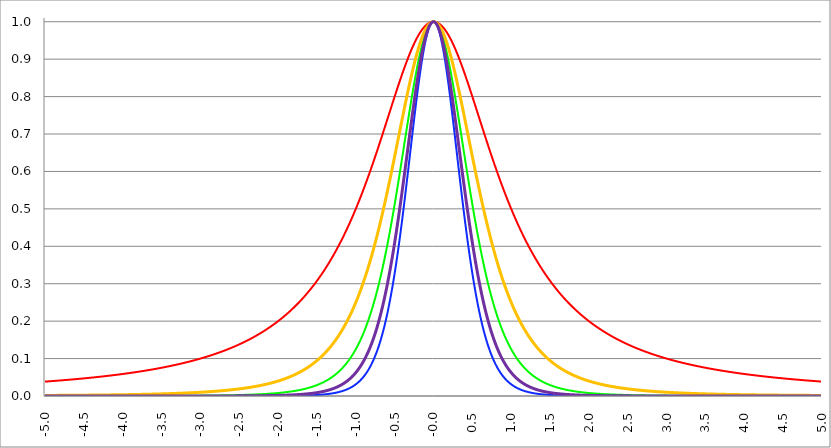
| Category | Series 1 | Series 0 | Series 2 | Series 3 | Series 4 |
|---|---|---|---|---|---|
| -5.0 | 0.038 | 0 | 0 | 0.001 | 0 |
| -4.995 | 0.039 | 0 | 0 | 0.001 | 0 |
| -4.99 | 0.039 | 0 | 0 | 0.001 | 0 |
| -4.985 | 0.039 | 0 | 0 | 0.001 | 0 |
| -4.98 | 0.039 | 0 | 0 | 0.002 | 0 |
| -4.975 | 0.039 | 0 | 0 | 0.002 | 0 |
| -4.97 | 0.039 | 0 | 0 | 0.002 | 0 |
| -4.965000000000001 | 0.039 | 0 | 0 | 0.002 | 0 |
| -4.960000000000001 | 0.039 | 0 | 0 | 0.002 | 0 |
| -4.955000000000001 | 0.039 | 0 | 0 | 0.002 | 0 |
| -4.950000000000001 | 0.039 | 0 | 0 | 0.002 | 0 |
| -4.945000000000001 | 0.039 | 0 | 0 | 0.002 | 0 |
| -4.940000000000001 | 0.039 | 0 | 0 | 0.002 | 0 |
| -4.935000000000001 | 0.039 | 0 | 0 | 0.002 | 0 |
| -4.930000000000001 | 0.04 | 0 | 0 | 0.002 | 0 |
| -4.925000000000002 | 0.04 | 0 | 0 | 0.002 | 0 |
| -4.920000000000002 | 0.04 | 0 | 0 | 0.002 | 0 |
| -4.915000000000002 | 0.04 | 0 | 0 | 0.002 | 0 |
| -4.910000000000002 | 0.04 | 0 | 0 | 0.002 | 0 |
| -4.905000000000002 | 0.04 | 0 | 0 | 0.002 | 0 |
| -4.900000000000002 | 0.04 | 0 | 0 | 0.002 | 0 |
| -4.895000000000002 | 0.04 | 0 | 0 | 0.002 | 0 |
| -4.890000000000002 | 0.04 | 0 | 0 | 0.002 | 0 |
| -4.885000000000002 | 0.04 | 0 | 0 | 0.002 | 0 |
| -4.880000000000002 | 0.04 | 0 | 0 | 0.002 | 0 |
| -4.875000000000003 | 0.04 | 0 | 0 | 0.002 | 0 |
| -4.870000000000003 | 0.04 | 0 | 0 | 0.002 | 0 |
| -4.865000000000003 | 0.041 | 0 | 0 | 0.002 | 0 |
| -4.860000000000003 | 0.041 | 0 | 0 | 0.002 | 0 |
| -4.855000000000003 | 0.041 | 0 | 0 | 0.002 | 0 |
| -4.850000000000003 | 0.041 | 0 | 0 | 0.002 | 0 |
| -4.845000000000003 | 0.041 | 0 | 0 | 0.002 | 0 |
| -4.840000000000003 | 0.041 | 0 | 0 | 0.002 | 0 |
| -4.835000000000003 | 0.041 | 0 | 0 | 0.002 | 0 |
| -4.830000000000004 | 0.041 | 0 | 0 | 0.002 | 0 |
| -4.825000000000004 | 0.041 | 0 | 0 | 0.002 | 0 |
| -4.820000000000004 | 0.041 | 0 | 0 | 0.002 | 0 |
| -4.815000000000004 | 0.041 | 0 | 0 | 0.002 | 0 |
| -4.810000000000004 | 0.041 | 0 | 0 | 0.002 | 0 |
| -4.805000000000004 | 0.042 | 0 | 0 | 0.002 | 0 |
| -4.800000000000004 | 0.042 | 0 | 0 | 0.002 | 0 |
| -4.795000000000004 | 0.042 | 0 | 0 | 0.002 | 0 |
| -4.790000000000004 | 0.042 | 0 | 0 | 0.002 | 0 |
| -4.785000000000004 | 0.042 | 0 | 0 | 0.002 | 0 |
| -4.780000000000004 | 0.042 | 0 | 0 | 0.002 | 0 |
| -4.775000000000004 | 0.042 | 0 | 0 | 0.002 | 0 |
| -4.770000000000004 | 0.042 | 0 | 0 | 0.002 | 0 |
| -4.765000000000005 | 0.042 | 0 | 0 | 0.002 | 0 |
| -4.760000000000005 | 0.042 | 0 | 0 | 0.002 | 0 |
| -4.755000000000005 | 0.042 | 0 | 0 | 0.002 | 0 |
| -4.750000000000005 | 0.042 | 0 | 0 | 0.002 | 0 |
| -4.745000000000005 | 0.043 | 0 | 0 | 0.002 | 0 |
| -4.740000000000005 | 0.043 | 0 | 0 | 0.002 | 0 |
| -4.735000000000005 | 0.043 | 0 | 0 | 0.002 | 0 |
| -4.730000000000005 | 0.043 | 0 | 0 | 0.002 | 0 |
| -4.725000000000006 | 0.043 | 0 | 0 | 0.002 | 0 |
| -4.720000000000006 | 0.043 | 0 | 0 | 0.002 | 0 |
| -4.715000000000006 | 0.043 | 0 | 0 | 0.002 | 0 |
| -4.710000000000006 | 0.043 | 0 | 0 | 0.002 | 0 |
| -4.705000000000006 | 0.043 | 0 | 0 | 0.002 | 0 |
| -4.700000000000006 | 0.043 | 0 | 0 | 0.002 | 0 |
| -4.695000000000006 | 0.043 | 0 | 0 | 0.002 | 0 |
| -4.690000000000006 | 0.043 | 0 | 0 | 0.002 | 0 |
| -4.685000000000007 | 0.044 | 0 | 0 | 0.002 | 0 |
| -4.680000000000007 | 0.044 | 0 | 0 | 0.002 | 0 |
| -4.675000000000007 | 0.044 | 0 | 0 | 0.002 | 0 |
| -4.670000000000007 | 0.044 | 0 | 0 | 0.002 | 0 |
| -4.665000000000007 | 0.044 | 0 | 0 | 0.002 | 0 |
| -4.660000000000007 | 0.044 | 0 | 0 | 0.002 | 0 |
| -4.655000000000007 | 0.044 | 0 | 0 | 0.002 | 0 |
| -4.650000000000007 | 0.044 | 0 | 0 | 0.002 | 0 |
| -4.645000000000007 | 0.044 | 0 | 0 | 0.002 | 0 |
| -4.640000000000008 | 0.044 | 0 | 0 | 0.002 | 0 |
| -4.635000000000008 | 0.044 | 0 | 0 | 0.002 | 0 |
| -4.630000000000008 | 0.045 | 0 | 0 | 0.002 | 0 |
| -4.625000000000008 | 0.045 | 0 | 0 | 0.002 | 0 |
| -4.620000000000008 | 0.045 | 0 | 0 | 0.002 | 0 |
| -4.615000000000008 | 0.045 | 0 | 0 | 0.002 | 0 |
| -4.610000000000008 | 0.045 | 0 | 0 | 0.002 | 0 |
| -4.605000000000008 | 0.045 | 0 | 0 | 0.002 | 0 |
| -4.600000000000008 | 0.045 | 0 | 0 | 0.002 | 0 |
| -4.595000000000009 | 0.045 | 0 | 0 | 0.002 | 0 |
| -4.590000000000009 | 0.045 | 0 | 0 | 0.002 | 0 |
| -4.585000000000009 | 0.045 | 0 | 0 | 0.002 | 0 |
| -4.580000000000009 | 0.046 | 0 | 0 | 0.002 | 0 |
| -4.57500000000001 | 0.046 | 0 | 0 | 0.002 | 0 |
| -4.57000000000001 | 0.046 | 0 | 0 | 0.002 | 0 |
| -4.565000000000009 | 0.046 | 0 | 0 | 0.002 | 0 |
| -4.560000000000009 | 0.046 | 0 | 0 | 0.002 | 0 |
| -4.555000000000009 | 0.046 | 0 | 0 | 0.002 | 0 |
| -4.55000000000001 | 0.046 | 0 | 0 | 0.002 | 0 |
| -4.54500000000001 | 0.046 | 0 | 0 | 0.002 | 0 |
| -4.54000000000001 | 0.046 | 0 | 0 | 0.002 | 0 |
| -4.53500000000001 | 0.046 | 0 | 0 | 0.002 | 0 |
| -4.53000000000001 | 0.046 | 0 | 0 | 0.002 | 0 |
| -4.52500000000001 | 0.047 | 0 | 0 | 0.002 | 0 |
| -4.52000000000001 | 0.047 | 0 | 0 | 0.002 | 0 |
| -4.51500000000001 | 0.047 | 0 | 0 | 0.002 | 0 |
| -4.51000000000001 | 0.047 | 0 | 0 | 0.002 | 0 |
| -4.505000000000011 | 0.047 | 0 | 0 | 0.002 | 0 |
| -4.500000000000011 | 0.047 | 0 | 0 | 0.002 | 0 |
| -4.495000000000011 | 0.047 | 0 | 0 | 0.002 | 0 |
| -4.490000000000011 | 0.047 | 0 | 0 | 0.002 | 0 |
| -4.485000000000011 | 0.047 | 0 | 0 | 0.002 | 0 |
| -4.480000000000011 | 0.047 | 0 | 0 | 0.002 | 0 |
| -4.475000000000011 | 0.048 | 0 | 0 | 0.002 | 0 |
| -4.470000000000011 | 0.048 | 0 | 0 | 0.002 | 0 |
| -4.465000000000011 | 0.048 | 0 | 0 | 0.002 | 0 |
| -4.460000000000011 | 0.048 | 0 | 0 | 0.002 | 0 |
| -4.455000000000012 | 0.048 | 0 | 0 | 0.002 | 0 |
| -4.450000000000012 | 0.048 | 0 | 0 | 0.002 | 0 |
| -4.445000000000012 | 0.048 | 0 | 0 | 0.002 | 0 |
| -4.440000000000012 | 0.048 | 0 | 0 | 0.002 | 0 |
| -4.435000000000012 | 0.048 | 0 | 0 | 0.002 | 0 |
| -4.430000000000012 | 0.048 | 0 | 0 | 0.002 | 0 |
| -4.425000000000012 | 0.049 | 0 | 0 | 0.002 | 0 |
| -4.420000000000012 | 0.049 | 0 | 0 | 0.002 | 0 |
| -4.415000000000012 | 0.049 | 0 | 0 | 0.002 | 0 |
| -4.410000000000013 | 0.049 | 0 | 0 | 0.002 | 0 |
| -4.405000000000013 | 0.049 | 0 | 0 | 0.002 | 0 |
| -4.400000000000013 | 0.049 | 0 | 0 | 0.002 | 0 |
| -4.395000000000013 | 0.049 | 0 | 0 | 0.002 | 0 |
| -4.390000000000013 | 0.049 | 0 | 0 | 0.002 | 0 |
| -4.385000000000013 | 0.049 | 0 | 0 | 0.002 | 0 |
| -4.380000000000013 | 0.05 | 0 | 0 | 0.002 | 0 |
| -4.375000000000013 | 0.05 | 0 | 0 | 0.002 | 0 |
| -4.370000000000013 | 0.05 | 0 | 0 | 0.002 | 0 |
| -4.365000000000013 | 0.05 | 0 | 0 | 0.002 | 0 |
| -4.360000000000014 | 0.05 | 0 | 0 | 0.002 | 0 |
| -4.355000000000014 | 0.05 | 0 | 0 | 0.003 | 0 |
| -4.350000000000014 | 0.05 | 0 | 0 | 0.003 | 0 |
| -4.345000000000014 | 0.05 | 0 | 0 | 0.003 | 0 |
| -4.340000000000014 | 0.05 | 0 | 0 | 0.003 | 0 |
| -4.335000000000014 | 0.051 | 0 | 0 | 0.003 | 0 |
| -4.330000000000014 | 0.051 | 0 | 0 | 0.003 | 0 |
| -4.325000000000014 | 0.051 | 0 | 0 | 0.003 | 0 |
| -4.320000000000014 | 0.051 | 0 | 0 | 0.003 | 0 |
| -4.315000000000015 | 0.051 | 0 | 0 | 0.003 | 0 |
| -4.310000000000015 | 0.051 | 0 | 0 | 0.003 | 0 |
| -4.305000000000015 | 0.051 | 0 | 0 | 0.003 | 0 |
| -4.300000000000015 | 0.051 | 0 | 0 | 0.003 | 0 |
| -4.295000000000015 | 0.051 | 0 | 0 | 0.003 | 0 |
| -4.290000000000015 | 0.052 | 0 | 0 | 0.003 | 0 |
| -4.285000000000015 | 0.052 | 0 | 0 | 0.003 | 0 |
| -4.280000000000015 | 0.052 | 0 | 0 | 0.003 | 0 |
| -4.275000000000015 | 0.052 | 0 | 0 | 0.003 | 0 |
| -4.270000000000015 | 0.052 | 0 | 0 | 0.003 | 0 |
| -4.265000000000016 | 0.052 | 0 | 0 | 0.003 | 0 |
| -4.260000000000016 | 0.052 | 0 | 0 | 0.003 | 0 |
| -4.255000000000016 | 0.052 | 0 | 0 | 0.003 | 0 |
| -4.250000000000016 | 0.052 | 0 | 0 | 0.003 | 0 |
| -4.245000000000016 | 0.053 | 0 | 0 | 0.003 | 0 |
| -4.240000000000016 | 0.053 | 0 | 0 | 0.003 | 0 |
| -4.235000000000016 | 0.053 | 0 | 0 | 0.003 | 0 |
| -4.230000000000016 | 0.053 | 0 | 0 | 0.003 | 0 |
| -4.225000000000017 | 0.053 | 0 | 0 | 0.003 | 0 |
| -4.220000000000017 | 0.053 | 0 | 0 | 0.003 | 0 |
| -4.215000000000017 | 0.053 | 0 | 0 | 0.003 | 0 |
| -4.210000000000017 | 0.053 | 0 | 0 | 0.003 | 0 |
| -4.205000000000017 | 0.054 | 0 | 0 | 0.003 | 0 |
| -4.200000000000017 | 0.054 | 0 | 0 | 0.003 | 0 |
| -4.195000000000017 | 0.054 | 0 | 0 | 0.003 | 0 |
| -4.190000000000017 | 0.054 | 0 | 0 | 0.003 | 0 |
| -4.185000000000017 | 0.054 | 0 | 0 | 0.003 | 0 |
| -4.180000000000017 | 0.054 | 0 | 0 | 0.003 | 0 |
| -4.175000000000018 | 0.054 | 0 | 0 | 0.003 | 0 |
| -4.170000000000018 | 0.054 | 0 | 0 | 0.003 | 0 |
| -4.165000000000018 | 0.055 | 0 | 0 | 0.003 | 0 |
| -4.160000000000018 | 0.055 | 0 | 0 | 0.003 | 0 |
| -4.155000000000018 | 0.055 | 0 | 0 | 0.003 | 0 |
| -4.150000000000018 | 0.055 | 0 | 0 | 0.003 | 0 |
| -4.145000000000018 | 0.055 | 0 | 0 | 0.003 | 0 |
| -4.140000000000018 | 0.055 | 0 | 0 | 0.003 | 0 |
| -4.135000000000018 | 0.055 | 0 | 0 | 0.003 | 0 |
| -4.130000000000019 | 0.055 | 0 | 0 | 0.003 | 0 |
| -4.125000000000019 | 0.056 | 0 | 0 | 0.003 | 0 |
| -4.120000000000019 | 0.056 | 0 | 0 | 0.003 | 0 |
| -4.115000000000019 | 0.056 | 0 | 0 | 0.003 | 0 |
| -4.110000000000019 | 0.056 | 0 | 0 | 0.003 | 0 |
| -4.105000000000019 | 0.056 | 0 | 0 | 0.003 | 0 |
| -4.100000000000019 | 0.056 | 0 | 0 | 0.003 | 0 |
| -4.095000000000019 | 0.056 | 0 | 0 | 0.003 | 0 |
| -4.090000000000019 | 0.056 | 0 | 0 | 0.003 | 0 |
| -4.085000000000019 | 0.057 | 0 | 0 | 0.003 | 0 |
| -4.08000000000002 | 0.057 | 0 | 0 | 0.003 | 0 |
| -4.07500000000002 | 0.057 | 0 | 0 | 0.003 | 0 |
| -4.07000000000002 | 0.057 | 0 | 0 | 0.003 | 0 |
| -4.06500000000002 | 0.057 | 0 | 0 | 0.003 | 0 |
| -4.06000000000002 | 0.057 | 0 | 0 | 0.003 | 0 |
| -4.05500000000002 | 0.057 | 0 | 0 | 0.003 | 0 |
| -4.05000000000002 | 0.057 | 0 | 0 | 0.003 | 0 |
| -4.04500000000002 | 0.058 | 0 | 0 | 0.003 | 0 |
| -4.04000000000002 | 0.058 | 0 | 0 | 0.003 | 0 |
| -4.03500000000002 | 0.058 | 0 | 0 | 0.003 | 0 |
| -4.03000000000002 | 0.058 | 0 | 0 | 0.003 | 0 |
| -4.025000000000021 | 0.058 | 0 | 0 | 0.003 | 0 |
| -4.020000000000021 | 0.058 | 0 | 0 | 0.003 | 0 |
| -4.015000000000021 | 0.058 | 0 | 0 | 0.003 | 0 |
| -4.010000000000021 | 0.059 | 0 | 0 | 0.003 | 0 |
| -4.005000000000021 | 0.059 | 0 | 0 | 0.003 | 0 |
| -4.000000000000021 | 0.059 | 0 | 0 | 0.003 | 0 |
| -3.995000000000021 | 0.059 | 0 | 0 | 0.003 | 0 |
| -3.990000000000021 | 0.059 | 0 | 0 | 0.003 | 0 |
| -3.985000000000022 | 0.059 | 0 | 0 | 0.004 | 0 |
| -3.980000000000022 | 0.059 | 0 | 0 | 0.004 | 0 |
| -3.975000000000022 | 0.06 | 0 | 0 | 0.004 | 0 |
| -3.970000000000022 | 0.06 | 0 | 0 | 0.004 | 0 |
| -3.965000000000022 | 0.06 | 0 | 0 | 0.004 | 0 |
| -3.960000000000022 | 0.06 | 0 | 0 | 0.004 | 0 |
| -3.955000000000022 | 0.06 | 0 | 0 | 0.004 | 0 |
| -3.950000000000022 | 0.06 | 0 | 0 | 0.004 | 0 |
| -3.945000000000022 | 0.06 | 0 | 0 | 0.004 | 0 |
| -3.940000000000023 | 0.061 | 0 | 0 | 0.004 | 0 |
| -3.935000000000023 | 0.061 | 0 | 0 | 0.004 | 0 |
| -3.930000000000023 | 0.061 | 0 | 0 | 0.004 | 0 |
| -3.925000000000023 | 0.061 | 0 | 0 | 0.004 | 0 |
| -3.920000000000023 | 0.061 | 0 | 0 | 0.004 | 0 |
| -3.915000000000023 | 0.061 | 0 | 0 | 0.004 | 0 |
| -3.910000000000023 | 0.061 | 0 | 0 | 0.004 | 0 |
| -3.905000000000023 | 0.062 | 0 | 0 | 0.004 | 0 |
| -3.900000000000023 | 0.062 | 0 | 0 | 0.004 | 0 |
| -3.895000000000023 | 0.062 | 0 | 0 | 0.004 | 0 |
| -3.890000000000024 | 0.062 | 0 | 0 | 0.004 | 0 |
| -3.885000000000024 | 0.062 | 0 | 0 | 0.004 | 0 |
| -3.880000000000024 | 0.062 | 0 | 0 | 0.004 | 0 |
| -3.875000000000024 | 0.062 | 0 | 0 | 0.004 | 0 |
| -3.870000000000024 | 0.063 | 0 | 0 | 0.004 | 0 |
| -3.865000000000024 | 0.063 | 0 | 0 | 0.004 | 0 |
| -3.860000000000024 | 0.063 | 0 | 0 | 0.004 | 0 |
| -3.855000000000024 | 0.063 | 0 | 0 | 0.004 | 0 |
| -3.850000000000024 | 0.063 | 0 | 0 | 0.004 | 0 |
| -3.845000000000025 | 0.063 | 0 | 0 | 0.004 | 0 |
| -3.840000000000025 | 0.064 | 0 | 0 | 0.004 | 0 |
| -3.835000000000025 | 0.064 | 0 | 0 | 0.004 | 0 |
| -3.830000000000025 | 0.064 | 0 | 0 | 0.004 | 0 |
| -3.825000000000025 | 0.064 | 0 | 0 | 0.004 | 0 |
| -3.820000000000025 | 0.064 | 0 | 0 | 0.004 | 0 |
| -3.815000000000025 | 0.064 | 0 | 0 | 0.004 | 0 |
| -3.810000000000025 | 0.064 | 0 | 0 | 0.004 | 0 |
| -3.805000000000025 | 0.065 | 0 | 0 | 0.004 | 0 |
| -3.800000000000026 | 0.065 | 0 | 0 | 0.004 | 0 |
| -3.795000000000026 | 0.065 | 0 | 0 | 0.004 | 0 |
| -3.790000000000026 | 0.065 | 0 | 0 | 0.004 | 0 |
| -3.785000000000026 | 0.065 | 0 | 0 | 0.004 | 0 |
| -3.780000000000026 | 0.065 | 0 | 0 | 0.004 | 0 |
| -3.775000000000026 | 0.066 | 0 | 0 | 0.004 | 0 |
| -3.770000000000026 | 0.066 | 0 | 0 | 0.004 | 0 |
| -3.765000000000026 | 0.066 | 0 | 0 | 0.004 | 0 |
| -3.760000000000026 | 0.066 | 0 | 0 | 0.004 | 0 |
| -3.755000000000026 | 0.066 | 0 | 0 | 0.004 | 0 |
| -3.750000000000027 | 0.066 | 0 | 0 | 0.004 | 0 |
| -3.745000000000027 | 0.067 | 0 | 0 | 0.004 | 0 |
| -3.740000000000027 | 0.067 | 0 | 0 | 0.004 | 0 |
| -3.735000000000027 | 0.067 | 0 | 0 | 0.004 | 0 |
| -3.730000000000027 | 0.067 | 0 | 0 | 0.004 | 0 |
| -3.725000000000027 | 0.067 | 0 | 0 | 0.005 | 0 |
| -3.720000000000027 | 0.067 | 0 | 0 | 0.005 | 0 |
| -3.715000000000027 | 0.068 | 0 | 0 | 0.005 | 0 |
| -3.710000000000027 | 0.068 | 0 | 0 | 0.005 | 0 |
| -3.705000000000028 | 0.068 | 0 | 0 | 0.005 | 0 |
| -3.700000000000028 | 0.068 | 0 | 0 | 0.005 | 0 |
| -3.695000000000028 | 0.068 | 0 | 0 | 0.005 | 0 |
| -3.690000000000028 | 0.068 | 0 | 0 | 0.005 | 0 |
| -3.685000000000028 | 0.069 | 0 | 0 | 0.005 | 0 |
| -3.680000000000028 | 0.069 | 0 | 0 | 0.005 | 0 |
| -3.675000000000028 | 0.069 | 0 | 0 | 0.005 | 0 |
| -3.670000000000028 | 0.069 | 0 | 0 | 0.005 | 0 |
| -3.665000000000028 | 0.069 | 0 | 0 | 0.005 | 0 |
| -3.660000000000028 | 0.069 | 0 | 0 | 0.005 | 0 |
| -3.655000000000029 | 0.07 | 0 | 0 | 0.005 | 0 |
| -3.650000000000029 | 0.07 | 0 | 0 | 0.005 | 0 |
| -3.645000000000029 | 0.07 | 0 | 0 | 0.005 | 0 |
| -3.640000000000029 | 0.07 | 0 | 0 | 0.005 | 0 |
| -3.635000000000029 | 0.07 | 0 | 0 | 0.005 | 0 |
| -3.630000000000029 | 0.071 | 0 | 0 | 0.005 | 0 |
| -3.625000000000029 | 0.071 | 0 | 0 | 0.005 | 0 |
| -3.620000000000029 | 0.071 | 0 | 0 | 0.005 | 0 |
| -3.615000000000029 | 0.071 | 0 | 0 | 0.005 | 0 |
| -3.61000000000003 | 0.071 | 0 | 0 | 0.005 | 0 |
| -3.60500000000003 | 0.071 | 0 | 0 | 0.005 | 0 |
| -3.60000000000003 | 0.072 | 0 | 0 | 0.005 | 0 |
| -3.59500000000003 | 0.072 | 0 | 0 | 0.005 | 0 |
| -3.59000000000003 | 0.072 | 0 | 0 | 0.005 | 0 |
| -3.58500000000003 | 0.072 | 0 | 0 | 0.005 | 0 |
| -3.58000000000003 | 0.072 | 0 | 0 | 0.005 | 0 |
| -3.57500000000003 | 0.073 | 0 | 0 | 0.005 | 0 |
| -3.57000000000003 | 0.073 | 0 | 0 | 0.005 | 0 |
| -3.565000000000031 | 0.073 | 0 | 0 | 0.005 | 0 |
| -3.560000000000031 | 0.073 | 0 | 0 | 0.005 | 0 |
| -3.555000000000031 | 0.073 | 0 | 0 | 0.005 | 0 |
| -3.550000000000031 | 0.074 | 0 | 0 | 0.005 | 0 |
| -3.545000000000031 | 0.074 | 0 | 0 | 0.005 | 0 |
| -3.540000000000031 | 0.074 | 0 | 0 | 0.005 | 0 |
| -3.535000000000031 | 0.074 | 0 | 0 | 0.005 | 0 |
| -3.530000000000031 | 0.074 | 0 | 0 | 0.006 | 0 |
| -3.525000000000031 | 0.074 | 0 | 0 | 0.006 | 0 |
| -3.520000000000032 | 0.075 | 0 | 0 | 0.006 | 0 |
| -3.515000000000032 | 0.075 | 0 | 0 | 0.006 | 0 |
| -3.510000000000032 | 0.075 | 0 | 0 | 0.006 | 0 |
| -3.505000000000032 | 0.075 | 0 | 0 | 0.006 | 0 |
| -3.500000000000032 | 0.075 | 0 | 0 | 0.006 | 0 |
| -3.495000000000032 | 0.076 | 0 | 0 | 0.006 | 0 |
| -3.490000000000032 | 0.076 | 0 | 0 | 0.006 | 0 |
| -3.485000000000032 | 0.076 | 0 | 0 | 0.006 | 0 |
| -3.480000000000032 | 0.076 | 0 | 0 | 0.006 | 0 |
| -3.475000000000032 | 0.076 | 0 | 0 | 0.006 | 0 |
| -3.470000000000033 | 0.077 | 0 | 0 | 0.006 | 0 |
| -3.465000000000033 | 0.077 | 0 | 0 | 0.006 | 0 |
| -3.460000000000033 | 0.077 | 0 | 0 | 0.006 | 0 |
| -3.455000000000033 | 0.077 | 0 | 0 | 0.006 | 0 |
| -3.450000000000033 | 0.078 | 0 | 0 | 0.006 | 0 |
| -3.445000000000033 | 0.078 | 0 | 0 | 0.006 | 0 |
| -3.440000000000033 | 0.078 | 0 | 0 | 0.006 | 0 |
| -3.435000000000033 | 0.078 | 0 | 0 | 0.006 | 0 |
| -3.430000000000033 | 0.078 | 0 | 0 | 0.006 | 0 |
| -3.425000000000034 | 0.079 | 0 | 0 | 0.006 | 0 |
| -3.420000000000034 | 0.079 | 0 | 0 | 0.006 | 0 |
| -3.415000000000034 | 0.079 | 0 | 0 | 0.006 | 0 |
| -3.410000000000034 | 0.079 | 0 | 0 | 0.006 | 0 |
| -3.405000000000034 | 0.079 | 0.001 | 0 | 0.006 | 0 |
| -3.400000000000034 | 0.08 | 0.001 | 0 | 0.006 | 0 |
| -3.395000000000034 | 0.08 | 0.001 | 0 | 0.006 | 0 |
| -3.390000000000034 | 0.08 | 0.001 | 0 | 0.006 | 0 |
| -3.385000000000034 | 0.08 | 0.001 | 0 | 0.006 | 0 |
| -3.380000000000034 | 0.08 | 0.001 | 0 | 0.006 | 0 |
| -3.375000000000035 | 0.081 | 0.001 | 0 | 0.007 | 0 |
| -3.370000000000035 | 0.081 | 0.001 | 0 | 0.007 | 0 |
| -3.365000000000035 | 0.081 | 0.001 | 0 | 0.007 | 0 |
| -3.360000000000035 | 0.081 | 0.001 | 0 | 0.007 | 0 |
| -3.355000000000035 | 0.082 | 0.001 | 0 | 0.007 | 0 |
| -3.350000000000035 | 0.082 | 0.001 | 0 | 0.007 | 0 |
| -3.345000000000035 | 0.082 | 0.001 | 0 | 0.007 | 0 |
| -3.340000000000035 | 0.082 | 0.001 | 0 | 0.007 | 0 |
| -3.335000000000035 | 0.082 | 0.001 | 0 | 0.007 | 0 |
| -3.330000000000036 | 0.083 | 0.001 | 0 | 0.007 | 0 |
| -3.325000000000036 | 0.083 | 0.001 | 0 | 0.007 | 0 |
| -3.320000000000036 | 0.083 | 0.001 | 0 | 0.007 | 0 |
| -3.315000000000036 | 0.083 | 0.001 | 0 | 0.007 | 0 |
| -3.310000000000036 | 0.084 | 0.001 | 0 | 0.007 | 0 |
| -3.305000000000036 | 0.084 | 0.001 | 0 | 0.007 | 0 |
| -3.300000000000036 | 0.084 | 0.001 | 0 | 0.007 | 0 |
| -3.295000000000036 | 0.084 | 0.001 | 0 | 0.007 | 0 |
| -3.290000000000036 | 0.085 | 0.001 | 0 | 0.007 | 0 |
| -3.285000000000036 | 0.085 | 0.001 | 0 | 0.007 | 0 |
| -3.280000000000036 | 0.085 | 0.001 | 0 | 0.007 | 0 |
| -3.275000000000037 | 0.085 | 0.001 | 0 | 0.007 | 0 |
| -3.270000000000037 | 0.086 | 0.001 | 0 | 0.007 | 0 |
| -3.265000000000037 | 0.086 | 0.001 | 0 | 0.007 | 0 |
| -3.260000000000037 | 0.086 | 0.001 | 0 | 0.007 | 0 |
| -3.255000000000037 | 0.086 | 0.001 | 0 | 0.007 | 0 |
| -3.250000000000037 | 0.086 | 0.001 | 0 | 0.007 | 0 |
| -3.245000000000037 | 0.087 | 0.001 | 0 | 0.008 | 0 |
| -3.240000000000037 | 0.087 | 0.001 | 0 | 0.008 | 0 |
| -3.235000000000038 | 0.087 | 0.001 | 0 | 0.008 | 0 |
| -3.230000000000038 | 0.087 | 0.001 | 0 | 0.008 | 0 |
| -3.225000000000038 | 0.088 | 0.001 | 0 | 0.008 | 0 |
| -3.220000000000038 | 0.088 | 0.001 | 0 | 0.008 | 0 |
| -3.215000000000038 | 0.088 | 0.001 | 0 | 0.008 | 0 |
| -3.210000000000038 | 0.088 | 0.001 | 0 | 0.008 | 0 |
| -3.205000000000038 | 0.089 | 0.001 | 0 | 0.008 | 0 |
| -3.200000000000038 | 0.089 | 0.001 | 0 | 0.008 | 0 |
| -3.195000000000038 | 0.089 | 0.001 | 0 | 0.008 | 0 |
| -3.190000000000039 | 0.089 | 0.001 | 0 | 0.008 | 0 |
| -3.185000000000039 | 0.09 | 0.001 | 0 | 0.008 | 0 |
| -3.180000000000039 | 0.09 | 0.001 | 0 | 0.008 | 0 |
| -3.175000000000039 | 0.09 | 0.001 | 0 | 0.008 | 0 |
| -3.170000000000039 | 0.091 | 0.001 | 0 | 0.008 | 0 |
| -3.16500000000004 | 0.091 | 0.001 | 0 | 0.008 | 0 |
| -3.16000000000004 | 0.091 | 0.001 | 0 | 0.008 | 0 |
| -3.155000000000039 | 0.091 | 0.001 | 0 | 0.008 | 0 |
| -3.150000000000039 | 0.092 | 0.001 | 0 | 0.008 | 0 |
| -3.14500000000004 | 0.092 | 0.001 | 0 | 0.008 | 0 |
| -3.14000000000004 | 0.092 | 0.001 | 0 | 0.008 | 0 |
| -3.13500000000004 | 0.092 | 0.001 | 0 | 0.009 | 0 |
| -3.13000000000004 | 0.093 | 0.001 | 0 | 0.009 | 0 |
| -3.12500000000004 | 0.093 | 0.001 | 0 | 0.009 | 0 |
| -3.12000000000004 | 0.093 | 0.001 | 0 | 0.009 | 0 |
| -3.11500000000004 | 0.093 | 0.001 | 0 | 0.009 | 0 |
| -3.11000000000004 | 0.094 | 0.001 | 0 | 0.009 | 0 |
| -3.10500000000004 | 0.094 | 0.001 | 0 | 0.009 | 0 |
| -3.10000000000004 | 0.094 | 0.001 | 0 | 0.009 | 0 |
| -3.095000000000041 | 0.095 | 0.001 | 0 | 0.009 | 0 |
| -3.090000000000041 | 0.095 | 0.001 | 0 | 0.009 | 0 |
| -3.085000000000041 | 0.095 | 0.001 | 0 | 0.009 | 0 |
| -3.080000000000041 | 0.095 | 0.001 | 0 | 0.009 | 0 |
| -3.075000000000041 | 0.096 | 0.001 | 0 | 0.009 | 0 |
| -3.070000000000041 | 0.096 | 0.001 | 0 | 0.009 | 0 |
| -3.065000000000041 | 0.096 | 0.001 | 0 | 0.009 | 0 |
| -3.060000000000041 | 0.096 | 0.001 | 0 | 0.009 | 0 |
| -3.055000000000041 | 0.097 | 0.001 | 0 | 0.009 | 0 |
| -3.050000000000042 | 0.097 | 0.001 | 0 | 0.009 | 0 |
| -3.045000000000042 | 0.097 | 0.001 | 0 | 0.009 | 0 |
| -3.040000000000042 | 0.098 | 0.001 | 0 | 0.01 | 0 |
| -3.035000000000042 | 0.098 | 0.001 | 0 | 0.01 | 0 |
| -3.030000000000042 | 0.098 | 0.001 | 0 | 0.01 | 0 |
| -3.025000000000042 | 0.099 | 0.001 | 0 | 0.01 | 0 |
| -3.020000000000042 | 0.099 | 0.001 | 0 | 0.01 | 0 |
| -3.015000000000042 | 0.099 | 0.001 | 0 | 0.01 | 0 |
| -3.010000000000042 | 0.099 | 0.001 | 0 | 0.01 | 0 |
| -3.005000000000043 | 0.1 | 0.001 | 0 | 0.01 | 0 |
| -3.000000000000043 | 0.1 | 0.001 | 0 | 0.01 | 0 |
| -2.995000000000043 | 0.1 | 0.001 | 0 | 0.01 | 0 |
| -2.990000000000043 | 0.101 | 0.001 | 0 | 0.01 | 0 |
| -2.985000000000043 | 0.101 | 0.001 | 0 | 0.01 | 0 |
| -2.980000000000043 | 0.101 | 0.001 | 0 | 0.01 | 0 |
| -2.975000000000043 | 0.102 | 0.001 | 0 | 0.01 | 0 |
| -2.970000000000043 | 0.102 | 0.001 | 0 | 0.01 | 0 |
| -2.965000000000043 | 0.102 | 0.001 | 0 | 0.01 | 0 |
| -2.960000000000043 | 0.102 | 0.001 | 0 | 0.01 | 0 |
| -2.955000000000044 | 0.103 | 0.001 | 0 | 0.011 | 0 |
| -2.950000000000044 | 0.103 | 0.001 | 0 | 0.011 | 0 |
| -2.945000000000044 | 0.103 | 0.001 | 0 | 0.011 | 0 |
| -2.940000000000044 | 0.104 | 0.001 | 0 | 0.011 | 0 |
| -2.935000000000044 | 0.104 | 0.001 | 0 | 0.011 | 0 |
| -2.930000000000044 | 0.104 | 0.001 | 0 | 0.011 | 0 |
| -2.925000000000044 | 0.105 | 0.001 | 0 | 0.011 | 0 |
| -2.920000000000044 | 0.105 | 0.001 | 0 | 0.011 | 0 |
| -2.915000000000044 | 0.105 | 0.001 | 0 | 0.011 | 0 |
| -2.910000000000045 | 0.106 | 0.001 | 0 | 0.011 | 0 |
| -2.905000000000045 | 0.106 | 0.001 | 0 | 0.011 | 0 |
| -2.900000000000045 | 0.106 | 0.001 | 0 | 0.011 | 0 |
| -2.895000000000045 | 0.107 | 0.001 | 0 | 0.011 | 0 |
| -2.890000000000045 | 0.107 | 0.001 | 0 | 0.011 | 0 |
| -2.885000000000045 | 0.107 | 0.001 | 0 | 0.012 | 0 |
| -2.880000000000045 | 0.108 | 0.001 | 0 | 0.012 | 0 |
| -2.875000000000045 | 0.108 | 0.001 | 0 | 0.012 | 0 |
| -2.870000000000045 | 0.108 | 0.001 | 0 | 0.012 | 0 |
| -2.865000000000045 | 0.109 | 0.001 | 0 | 0.012 | 0 |
| -2.860000000000046 | 0.109 | 0.001 | 0 | 0.012 | 0 |
| -2.855000000000046 | 0.109 | 0.001 | 0 | 0.012 | 0 |
| -2.850000000000046 | 0.11 | 0.001 | 0 | 0.012 | 0 |
| -2.845000000000046 | 0.11 | 0.001 | 0 | 0.012 | 0 |
| -2.840000000000046 | 0.11 | 0.001 | 0 | 0.012 | 0 |
| -2.835000000000046 | 0.111 | 0.001 | 0 | 0.012 | 0 |
| -2.830000000000046 | 0.111 | 0.001 | 0 | 0.012 | 0 |
| -2.825000000000046 | 0.111 | 0.001 | 0 | 0.012 | 0 |
| -2.820000000000046 | 0.112 | 0.001 | 0 | 0.012 | 0 |
| -2.815000000000047 | 0.112 | 0.001 | 0 | 0.013 | 0 |
| -2.810000000000047 | 0.112 | 0.001 | 0 | 0.013 | 0 |
| -2.805000000000047 | 0.113 | 0.001 | 0 | 0.013 | 0 |
| -2.800000000000047 | 0.113 | 0.001 | 0 | 0.013 | 0 |
| -2.795000000000047 | 0.113 | 0.001 | 0 | 0.013 | 0 |
| -2.790000000000047 | 0.114 | 0.001 | 0 | 0.013 | 0 |
| -2.785000000000047 | 0.114 | 0.001 | 0 | 0.013 | 0 |
| -2.780000000000047 | 0.115 | 0.002 | 0 | 0.013 | 0 |
| -2.775000000000047 | 0.115 | 0.002 | 0 | 0.013 | 0 |
| -2.770000000000047 | 0.115 | 0.002 | 0 | 0.013 | 0 |
| -2.765000000000048 | 0.116 | 0.002 | 0 | 0.013 | 0 |
| -2.760000000000048 | 0.116 | 0.002 | 0 | 0.013 | 0 |
| -2.755000000000048 | 0.116 | 0.002 | 0 | 0.014 | 0 |
| -2.750000000000048 | 0.117 | 0.002 | 0 | 0.014 | 0 |
| -2.745000000000048 | 0.117 | 0.002 | 0 | 0.014 | 0 |
| -2.740000000000048 | 0.118 | 0.002 | 0 | 0.014 | 0 |
| -2.735000000000048 | 0.118 | 0.002 | 0 | 0.014 | 0 |
| -2.730000000000048 | 0.118 | 0.002 | 0 | 0.014 | 0 |
| -2.725000000000048 | 0.119 | 0.002 | 0 | 0.014 | 0 |
| -2.720000000000049 | 0.119 | 0.002 | 0 | 0.014 | 0 |
| -2.715000000000049 | 0.119 | 0.002 | 0 | 0.014 | 0 |
| -2.710000000000049 | 0.12 | 0.002 | 0 | 0.014 | 0 |
| -2.705000000000049 | 0.12 | 0.002 | 0 | 0.014 | 0 |
| -2.700000000000049 | 0.121 | 0.002 | 0 | 0.015 | 0 |
| -2.695000000000049 | 0.121 | 0.002 | 0 | 0.015 | 0 |
| -2.690000000000049 | 0.121 | 0.002 | 0 | 0.015 | 0 |
| -2.685000000000049 | 0.122 | 0.002 | 0 | 0.015 | 0 |
| -2.680000000000049 | 0.122 | 0.002 | 0 | 0.015 | 0 |
| -2.675000000000049 | 0.123 | 0.002 | 0 | 0.015 | 0 |
| -2.67000000000005 | 0.123 | 0.002 | 0 | 0.015 | 0 |
| -2.66500000000005 | 0.123 | 0.002 | 0 | 0.015 | 0 |
| -2.66000000000005 | 0.124 | 0.002 | 0 | 0.015 | 0 |
| -2.65500000000005 | 0.124 | 0.002 | 0 | 0.015 | 0 |
| -2.65000000000005 | 0.125 | 0.002 | 0 | 0.016 | 0 |
| -2.64500000000005 | 0.125 | 0.002 | 0 | 0.016 | 0 |
| -2.64000000000005 | 0.125 | 0.002 | 0 | 0.016 | 0 |
| -2.63500000000005 | 0.126 | 0.002 | 0 | 0.016 | 0 |
| -2.63000000000005 | 0.126 | 0.002 | 0 | 0.016 | 0 |
| -2.625000000000051 | 0.127 | 0.002 | 0 | 0.016 | 0 |
| -2.620000000000051 | 0.127 | 0.002 | 0 | 0.016 | 0 |
| -2.615000000000051 | 0.128 | 0.002 | 0 | 0.016 | 0 |
| -2.610000000000051 | 0.128 | 0.002 | 0 | 0.016 | 0 |
| -2.605000000000051 | 0.128 | 0.002 | 0 | 0.016 | 0 |
| -2.600000000000051 | 0.129 | 0.002 | 0 | 0.017 | 0 |
| -2.595000000000051 | 0.129 | 0.002 | 0 | 0.017 | 0 |
| -2.590000000000051 | 0.13 | 0.002 | 0 | 0.017 | 0 |
| -2.585000000000051 | 0.13 | 0.002 | 0 | 0.017 | 0 |
| -2.580000000000052 | 0.131 | 0.002 | 0 | 0.017 | 0 |
| -2.575000000000052 | 0.131 | 0.002 | 0 | 0.017 | 0 |
| -2.570000000000052 | 0.131 | 0.002 | 0 | 0.017 | 0 |
| -2.565000000000052 | 0.132 | 0.002 | 0 | 0.017 | 0 |
| -2.560000000000052 | 0.132 | 0.002 | 0 | 0.018 | 0 |
| -2.555000000000052 | 0.133 | 0.002 | 0 | 0.018 | 0 |
| -2.550000000000052 | 0.133 | 0.002 | 0 | 0.018 | 0 |
| -2.545000000000052 | 0.134 | 0.002 | 0 | 0.018 | 0 |
| -2.540000000000052 | 0.134 | 0.002 | 0 | 0.018 | 0 |
| -2.535000000000053 | 0.135 | 0.002 | 0 | 0.018 | 0 |
| -2.530000000000053 | 0.135 | 0.002 | 0 | 0.018 | 0 |
| -2.525000000000053 | 0.136 | 0.002 | 0 | 0.018 | 0 |
| -2.520000000000053 | 0.136 | 0.003 | 0 | 0.019 | 0 |
| -2.515000000000053 | 0.137 | 0.003 | 0 | 0.019 | 0 |
| -2.510000000000053 | 0.137 | 0.003 | 0 | 0.019 | 0 |
| -2.505000000000053 | 0.137 | 0.003 | 0 | 0.019 | 0 |
| -2.500000000000053 | 0.138 | 0.003 | 0 | 0.019 | 0 |
| -2.495000000000053 | 0.138 | 0.003 | 0 | 0.019 | 0 |
| -2.490000000000053 | 0.139 | 0.003 | 0 | 0.019 | 0 |
| -2.485000000000054 | 0.139 | 0.003 | 0 | 0.019 | 0 |
| -2.480000000000054 | 0.14 | 0.003 | 0 | 0.02 | 0 |
| -2.475000000000054 | 0.14 | 0.003 | 0 | 0.02 | 0 |
| -2.470000000000054 | 0.141 | 0.003 | 0 | 0.02 | 0 |
| -2.465000000000054 | 0.141 | 0.003 | 0 | 0.02 | 0 |
| -2.460000000000054 | 0.142 | 0.003 | 0 | 0.02 | 0 |
| -2.455000000000054 | 0.142 | 0.003 | 0 | 0.02 | 0 |
| -2.450000000000054 | 0.143 | 0.003 | 0 | 0.02 | 0 |
| -2.445000000000054 | 0.143 | 0.003 | 0 | 0.021 | 0 |
| -2.440000000000055 | 0.144 | 0.003 | 0 | 0.021 | 0 |
| -2.435000000000055 | 0.144 | 0.003 | 0 | 0.021 | 0 |
| -2.430000000000055 | 0.145 | 0.003 | 0 | 0.021 | 0 |
| -2.425000000000055 | 0.145 | 0.003 | 0 | 0.021 | 0 |
| -2.420000000000055 | 0.146 | 0.003 | 0 | 0.021 | 0 |
| -2.415000000000055 | 0.146 | 0.003 | 0 | 0.021 | 0 |
| -2.410000000000055 | 0.147 | 0.003 | 0 | 0.022 | 0 |
| -2.405000000000055 | 0.147 | 0.003 | 0 | 0.022 | 0 |
| -2.400000000000055 | 0.148 | 0.003 | 0 | 0.022 | 0 |
| -2.395000000000055 | 0.148 | 0.003 | 0 | 0.022 | 0 |
| -2.390000000000056 | 0.149 | 0.003 | 0 | 0.022 | 0 |
| -2.385000000000056 | 0.15 | 0.003 | 0 | 0.022 | 0 |
| -2.380000000000056 | 0.15 | 0.003 | 0 | 0.023 | 0.001 |
| -2.375000000000056 | 0.151 | 0.003 | 0 | 0.023 | 0.001 |
| -2.370000000000056 | 0.151 | 0.003 | 0 | 0.023 | 0.001 |
| -2.365000000000056 | 0.152 | 0.003 | 0 | 0.023 | 0.001 |
| -2.360000000000056 | 0.152 | 0.004 | 0 | 0.023 | 0.001 |
| -2.355000000000056 | 0.153 | 0.004 | 0 | 0.023 | 0.001 |
| -2.350000000000056 | 0.153 | 0.004 | 0 | 0.024 | 0.001 |
| -2.345000000000057 | 0.154 | 0.004 | 0 | 0.024 | 0.001 |
| -2.340000000000057 | 0.154 | 0.004 | 0 | 0.024 | 0.001 |
| -2.335000000000057 | 0.155 | 0.004 | 0 | 0.024 | 0.001 |
| -2.330000000000057 | 0.156 | 0.004 | 0 | 0.024 | 0.001 |
| -2.325000000000057 | 0.156 | 0.004 | 0 | 0.024 | 0.001 |
| -2.320000000000057 | 0.157 | 0.004 | 0 | 0.025 | 0.001 |
| -2.315000000000057 | 0.157 | 0.004 | 0 | 0.025 | 0.001 |
| -2.310000000000057 | 0.158 | 0.004 | 0 | 0.025 | 0.001 |
| -2.305000000000057 | 0.158 | 0.004 | 0 | 0.025 | 0.001 |
| -2.300000000000058 | 0.159 | 0.004 | 0 | 0.025 | 0.001 |
| -2.295000000000058 | 0.16 | 0.004 | 0 | 0.025 | 0.001 |
| -2.290000000000058 | 0.16 | 0.004 | 0 | 0.026 | 0.001 |
| -2.285000000000058 | 0.161 | 0.004 | 0 | 0.026 | 0.001 |
| -2.280000000000058 | 0.161 | 0.004 | 0 | 0.026 | 0.001 |
| -2.275000000000058 | 0.162 | 0.004 | 0 | 0.026 | 0.001 |
| -2.270000000000058 | 0.163 | 0.004 | 0 | 0.026 | 0.001 |
| -2.265000000000058 | 0.163 | 0.004 | 0 | 0.027 | 0.001 |
| -2.260000000000058 | 0.164 | 0.004 | 0 | 0.027 | 0.001 |
| -2.255000000000058 | 0.164 | 0.004 | 0 | 0.027 | 0.001 |
| -2.250000000000059 | 0.165 | 0.004 | 0 | 0.027 | 0.001 |
| -2.245000000000059 | 0.166 | 0.005 | 0 | 0.027 | 0.001 |
| -2.240000000000059 | 0.166 | 0.005 | 0 | 0.028 | 0.001 |
| -2.235000000000059 | 0.167 | 0.005 | 0 | 0.028 | 0.001 |
| -2.23000000000006 | 0.167 | 0.005 | 0 | 0.028 | 0.001 |
| -2.22500000000006 | 0.168 | 0.005 | 0 | 0.028 | 0.001 |
| -2.22000000000006 | 0.169 | 0.005 | 0 | 0.028 | 0.001 |
| -2.215000000000059 | 0.169 | 0.005 | 0 | 0.029 | 0.001 |
| -2.210000000000059 | 0.17 | 0.005 | 0 | 0.029 | 0.001 |
| -2.20500000000006 | 0.171 | 0.005 | 0 | 0.029 | 0.001 |
| -2.20000000000006 | 0.171 | 0.005 | 0 | 0.029 | 0.001 |
| -2.19500000000006 | 0.172 | 0.005 | 0 | 0.03 | 0.001 |
| -2.19000000000006 | 0.173 | 0.005 | 0 | 0.03 | 0.001 |
| -2.18500000000006 | 0.173 | 0.005 | 0 | 0.03 | 0.001 |
| -2.18000000000006 | 0.174 | 0.005 | 0 | 0.03 | 0.001 |
| -2.17500000000006 | 0.175 | 0.005 | 0 | 0.03 | 0.001 |
| -2.17000000000006 | 0.175 | 0.005 | 0 | 0.031 | 0.001 |
| -2.16500000000006 | 0.176 | 0.005 | 0 | 0.031 | 0.001 |
| -2.160000000000061 | 0.177 | 0.005 | 0 | 0.031 | 0.001 |
| -2.155000000000061 | 0.177 | 0.006 | 0 | 0.031 | 0.001 |
| -2.150000000000061 | 0.178 | 0.006 | 0 | 0.032 | 0.001 |
| -2.145000000000061 | 0.179 | 0.006 | 0 | 0.032 | 0.001 |
| -2.140000000000061 | 0.179 | 0.006 | 0 | 0.032 | 0.001 |
| -2.135000000000061 | 0.18 | 0.006 | 0 | 0.032 | 0.001 |
| -2.130000000000061 | 0.181 | 0.006 | 0 | 0.033 | 0.001 |
| -2.125000000000061 | 0.181 | 0.006 | 0 | 0.033 | 0.001 |
| -2.120000000000061 | 0.182 | 0.006 | 0 | 0.033 | 0.001 |
| -2.115000000000061 | 0.183 | 0.006 | 0 | 0.033 | 0.001 |
| -2.110000000000062 | 0.183 | 0.006 | 0 | 0.034 | 0.001 |
| -2.105000000000062 | 0.184 | 0.006 | 0 | 0.034 | 0.001 |
| -2.100000000000062 | 0.185 | 0.006 | 0 | 0.034 | 0.001 |
| -2.095000000000062 | 0.186 | 0.006 | 0 | 0.034 | 0.001 |
| -2.090000000000062 | 0.186 | 0.006 | 0 | 0.035 | 0.001 |
| -2.085000000000062 | 0.187 | 0.007 | 0 | 0.035 | 0.001 |
| -2.080000000000062 | 0.188 | 0.007 | 0 | 0.035 | 0.001 |
| -2.075000000000062 | 0.188 | 0.007 | 0 | 0.036 | 0.001 |
| -2.070000000000062 | 0.189 | 0.007 | 0 | 0.036 | 0.001 |
| -2.065000000000063 | 0.19 | 0.007 | 0 | 0.036 | 0.001 |
| -2.060000000000063 | 0.191 | 0.007 | 0 | 0.036 | 0.001 |
| -2.055000000000063 | 0.191 | 0.007 | 0 | 0.037 | 0.001 |
| -2.050000000000063 | 0.192 | 0.007 | 0 | 0.037 | 0.001 |
| -2.045000000000063 | 0.193 | 0.007 | 0 | 0.037 | 0.001 |
| -2.040000000000063 | 0.194 | 0.007 | 0 | 0.038 | 0.001 |
| -2.035000000000063 | 0.195 | 0.007 | 0 | 0.038 | 0.001 |
| -2.030000000000063 | 0.195 | 0.007 | 0 | 0.038 | 0.001 |
| -2.025000000000063 | 0.196 | 0.008 | 0 | 0.038 | 0.001 |
| -2.020000000000064 | 0.197 | 0.008 | 0 | 0.039 | 0.002 |
| -2.015000000000064 | 0.198 | 0.008 | 0 | 0.039 | 0.002 |
| -2.010000000000064 | 0.198 | 0.008 | 0 | 0.039 | 0.002 |
| -2.005000000000064 | 0.199 | 0.008 | 0 | 0.04 | 0.002 |
| -2.000000000000064 | 0.2 | 0.008 | 0 | 0.04 | 0.002 |
| -1.995000000000064 | 0.201 | 0.008 | 0 | 0.04 | 0.002 |
| -1.990000000000064 | 0.202 | 0.008 | 0 | 0.041 | 0.002 |
| -1.985000000000064 | 0.202 | 0.008 | 0 | 0.041 | 0.002 |
| -1.980000000000064 | 0.203 | 0.008 | 0 | 0.041 | 0.002 |
| -1.975000000000064 | 0.204 | 0.008 | 0 | 0.042 | 0.002 |
| -1.970000000000065 | 0.205 | 0.009 | 0 | 0.042 | 0.002 |
| -1.965000000000065 | 0.206 | 0.009 | 0 | 0.042 | 0.002 |
| -1.960000000000065 | 0.207 | 0.009 | 0 | 0.043 | 0.002 |
| -1.955000000000065 | 0.207 | 0.009 | 0 | 0.043 | 0.002 |
| -1.950000000000065 | 0.208 | 0.009 | 0 | 0.043 | 0.002 |
| -1.945000000000065 | 0.209 | 0.009 | 0 | 0.044 | 0.002 |
| -1.940000000000065 | 0.21 | 0.009 | 0 | 0.044 | 0.002 |
| -1.935000000000065 | 0.211 | 0.009 | 0 | 0.044 | 0.002 |
| -1.930000000000065 | 0.212 | 0.009 | 0 | 0.045 | 0.002 |
| -1.925000000000066 | 0.213 | 0.01 | 0 | 0.045 | 0.002 |
| -1.920000000000066 | 0.213 | 0.01 | 0 | 0.046 | 0.002 |
| -1.915000000000066 | 0.214 | 0.01 | 0 | 0.046 | 0.002 |
| -1.910000000000066 | 0.215 | 0.01 | 0 | 0.046 | 0.002 |
| -1.905000000000066 | 0.216 | 0.01 | 0 | 0.047 | 0.002 |
| -1.900000000000066 | 0.217 | 0.01 | 0 | 0.047 | 0.002 |
| -1.895000000000066 | 0.218 | 0.01 | 0 | 0.047 | 0.002 |
| -1.890000000000066 | 0.219 | 0.01 | 0.001 | 0.048 | 0.002 |
| -1.885000000000066 | 0.22 | 0.011 | 0.001 | 0.048 | 0.002 |
| -1.880000000000066 | 0.221 | 0.011 | 0.001 | 0.049 | 0.002 |
| -1.875000000000067 | 0.221 | 0.011 | 0.001 | 0.049 | 0.002 |
| -1.870000000000067 | 0.222 | 0.011 | 0.001 | 0.049 | 0.002 |
| -1.865000000000067 | 0.223 | 0.011 | 0.001 | 0.05 | 0.002 |
| -1.860000000000067 | 0.224 | 0.011 | 0.001 | 0.05 | 0.003 |
| -1.855000000000067 | 0.225 | 0.011 | 0.001 | 0.051 | 0.003 |
| -1.850000000000067 | 0.226 | 0.012 | 0.001 | 0.051 | 0.003 |
| -1.845000000000067 | 0.227 | 0.012 | 0.001 | 0.052 | 0.003 |
| -1.840000000000067 | 0.228 | 0.012 | 0.001 | 0.052 | 0.003 |
| -1.835000000000067 | 0.229 | 0.012 | 0.001 | 0.052 | 0.003 |
| -1.830000000000068 | 0.23 | 0.012 | 0.001 | 0.053 | 0.003 |
| -1.825000000000068 | 0.231 | 0.012 | 0.001 | 0.053 | 0.003 |
| -1.820000000000068 | 0.232 | 0.012 | 0.001 | 0.054 | 0.003 |
| -1.815000000000068 | 0.233 | 0.013 | 0.001 | 0.054 | 0.003 |
| -1.810000000000068 | 0.234 | 0.013 | 0.001 | 0.055 | 0.003 |
| -1.805000000000068 | 0.235 | 0.013 | 0.001 | 0.055 | 0.003 |
| -1.800000000000068 | 0.236 | 0.013 | 0.001 | 0.056 | 0.003 |
| -1.795000000000068 | 0.237 | 0.013 | 0.001 | 0.056 | 0.003 |
| -1.790000000000068 | 0.238 | 0.013 | 0.001 | 0.057 | 0.003 |
| -1.785000000000068 | 0.239 | 0.014 | 0.001 | 0.057 | 0.003 |
| -1.780000000000069 | 0.24 | 0.014 | 0.001 | 0.058 | 0.003 |
| -1.775000000000069 | 0.241 | 0.014 | 0.001 | 0.058 | 0.003 |
| -1.770000000000069 | 0.242 | 0.014 | 0.001 | 0.059 | 0.003 |
| -1.765000000000069 | 0.243 | 0.014 | 0.001 | 0.059 | 0.003 |
| -1.760000000000069 | 0.244 | 0.015 | 0.001 | 0.06 | 0.004 |
| -1.75500000000007 | 0.245 | 0.015 | 0.001 | 0.06 | 0.004 |
| -1.75000000000007 | 0.246 | 0.015 | 0.001 | 0.061 | 0.004 |
| -1.745000000000069 | 0.247 | 0.015 | 0.001 | 0.061 | 0.004 |
| -1.740000000000069 | 0.248 | 0.015 | 0.001 | 0.062 | 0.004 |
| -1.73500000000007 | 0.249 | 0.016 | 0.001 | 0.062 | 0.004 |
| -1.73000000000007 | 0.25 | 0.016 | 0.001 | 0.063 | 0.004 |
| -1.72500000000007 | 0.252 | 0.016 | 0.001 | 0.063 | 0.004 |
| -1.72000000000007 | 0.253 | 0.016 | 0.001 | 0.064 | 0.004 |
| -1.71500000000007 | 0.254 | 0.016 | 0.001 | 0.064 | 0.004 |
| -1.71000000000007 | 0.255 | 0.017 | 0.001 | 0.065 | 0.004 |
| -1.70500000000007 | 0.256 | 0.017 | 0.001 | 0.066 | 0.004 |
| -1.70000000000007 | 0.257 | 0.017 | 0.001 | 0.066 | 0.004 |
| -1.69500000000007 | 0.258 | 0.017 | 0.001 | 0.067 | 0.004 |
| -1.69000000000007 | 0.259 | 0.017 | 0.001 | 0.067 | 0.005 |
| -1.685000000000071 | 0.26 | 0.018 | 0.001 | 0.068 | 0.005 |
| -1.680000000000071 | 0.262 | 0.018 | 0.001 | 0.068 | 0.005 |
| -1.675000000000071 | 0.263 | 0.018 | 0.001 | 0.069 | 0.005 |
| -1.670000000000071 | 0.264 | 0.018 | 0.001 | 0.07 | 0.005 |
| -1.665000000000071 | 0.265 | 0.019 | 0.001 | 0.07 | 0.005 |
| -1.660000000000071 | 0.266 | 0.019 | 0.001 | 0.071 | 0.005 |
| -1.655000000000071 | 0.267 | 0.019 | 0.001 | 0.072 | 0.005 |
| -1.650000000000071 | 0.269 | 0.019 | 0.001 | 0.072 | 0.005 |
| -1.645000000000071 | 0.27 | 0.02 | 0.001 | 0.073 | 0.005 |
| -1.640000000000072 | 0.271 | 0.02 | 0.001 | 0.073 | 0.005 |
| -1.635000000000072 | 0.272 | 0.02 | 0.001 | 0.074 | 0.005 |
| -1.630000000000072 | 0.273 | 0.02 | 0.002 | 0.075 | 0.006 |
| -1.625000000000072 | 0.275 | 0.021 | 0.002 | 0.075 | 0.006 |
| -1.620000000000072 | 0.276 | 0.021 | 0.002 | 0.076 | 0.006 |
| -1.615000000000072 | 0.277 | 0.021 | 0.002 | 0.077 | 0.006 |
| -1.610000000000072 | 0.278 | 0.022 | 0.002 | 0.078 | 0.006 |
| -1.605000000000072 | 0.28 | 0.022 | 0.002 | 0.078 | 0.006 |
| -1.600000000000072 | 0.281 | 0.022 | 0.002 | 0.079 | 0.006 |
| -1.595000000000073 | 0.282 | 0.022 | 0.002 | 0.08 | 0.006 |
| -1.590000000000073 | 0.283 | 0.023 | 0.002 | 0.08 | 0.006 |
| -1.585000000000073 | 0.285 | 0.023 | 0.002 | 0.081 | 0.007 |
| -1.580000000000073 | 0.286 | 0.023 | 0.002 | 0.082 | 0.007 |
| -1.575000000000073 | 0.287 | 0.024 | 0.002 | 0.083 | 0.007 |
| -1.570000000000073 | 0.289 | 0.024 | 0.002 | 0.083 | 0.007 |
| -1.565000000000073 | 0.29 | 0.024 | 0.002 | 0.084 | 0.007 |
| -1.560000000000073 | 0.291 | 0.025 | 0.002 | 0.085 | 0.007 |
| -1.555000000000073 | 0.293 | 0.025 | 0.002 | 0.086 | 0.007 |
| -1.550000000000074 | 0.294 | 0.025 | 0.002 | 0.086 | 0.007 |
| -1.545000000000074 | 0.295 | 0.026 | 0.002 | 0.087 | 0.008 |
| -1.540000000000074 | 0.297 | 0.026 | 0.002 | 0.088 | 0.008 |
| -1.535000000000074 | 0.298 | 0.026 | 0.002 | 0.089 | 0.008 |
| -1.530000000000074 | 0.299 | 0.027 | 0.002 | 0.09 | 0.008 |
| -1.525000000000074 | 0.301 | 0.027 | 0.002 | 0.09 | 0.008 |
| -1.520000000000074 | 0.302 | 0.028 | 0.003 | 0.091 | 0.008 |
| -1.515000000000074 | 0.303 | 0.028 | 0.003 | 0.092 | 0.008 |
| -1.510000000000074 | 0.305 | 0.028 | 0.003 | 0.093 | 0.009 |
| -1.505000000000074 | 0.306 | 0.029 | 0.003 | 0.094 | 0.009 |
| -1.500000000000075 | 0.308 | 0.029 | 0.003 | 0.095 | 0.009 |
| -1.495000000000075 | 0.309 | 0.03 | 0.003 | 0.096 | 0.009 |
| -1.490000000000075 | 0.311 | 0.03 | 0.003 | 0.096 | 0.009 |
| -1.485000000000075 | 0.312 | 0.03 | 0.003 | 0.097 | 0.009 |
| -1.480000000000075 | 0.313 | 0.031 | 0.003 | 0.098 | 0.01 |
| -1.475000000000075 | 0.315 | 0.031 | 0.003 | 0.099 | 0.01 |
| -1.470000000000075 | 0.316 | 0.032 | 0.003 | 0.1 | 0.01 |
| -1.465000000000075 | 0.318 | 0.032 | 0.003 | 0.101 | 0.01 |
| -1.460000000000075 | 0.319 | 0.033 | 0.003 | 0.102 | 0.01 |
| -1.455000000000076 | 0.321 | 0.033 | 0.003 | 0.103 | 0.011 |
| -1.450000000000076 | 0.322 | 0.033 | 0.003 | 0.104 | 0.011 |
| -1.445000000000076 | 0.324 | 0.034 | 0.004 | 0.105 | 0.011 |
| -1.440000000000076 | 0.325 | 0.034 | 0.004 | 0.106 | 0.011 |
| -1.435000000000076 | 0.327 | 0.035 | 0.004 | 0.107 | 0.011 |
| -1.430000000000076 | 0.328 | 0.035 | 0.004 | 0.108 | 0.012 |
| -1.425000000000076 | 0.33 | 0.036 | 0.004 | 0.109 | 0.012 |
| -1.420000000000076 | 0.332 | 0.036 | 0.004 | 0.11 | 0.012 |
| -1.415000000000076 | 0.333 | 0.037 | 0.004 | 0.111 | 0.012 |
| -1.410000000000077 | 0.335 | 0.037 | 0.004 | 0.112 | 0.013 |
| -1.405000000000077 | 0.336 | 0.038 | 0.004 | 0.113 | 0.013 |
| -1.400000000000077 | 0.338 | 0.039 | 0.004 | 0.114 | 0.013 |
| -1.395000000000077 | 0.339 | 0.039 | 0.005 | 0.115 | 0.013 |
| -1.390000000000077 | 0.341 | 0.04 | 0.005 | 0.116 | 0.014 |
| -1.385000000000077 | 0.343 | 0.04 | 0.005 | 0.117 | 0.014 |
| -1.380000000000077 | 0.344 | 0.041 | 0.005 | 0.119 | 0.014 |
| -1.375000000000077 | 0.346 | 0.041 | 0.005 | 0.12 | 0.014 |
| -1.370000000000077 | 0.348 | 0.042 | 0.005 | 0.121 | 0.015 |
| -1.365000000000077 | 0.349 | 0.043 | 0.005 | 0.122 | 0.015 |
| -1.360000000000078 | 0.351 | 0.043 | 0.005 | 0.123 | 0.015 |
| -1.355000000000078 | 0.353 | 0.044 | 0.005 | 0.124 | 0.015 |
| -1.350000000000078 | 0.354 | 0.044 | 0.006 | 0.126 | 0.016 |
| -1.345000000000078 | 0.356 | 0.045 | 0.006 | 0.127 | 0.016 |
| -1.340000000000078 | 0.358 | 0.046 | 0.006 | 0.128 | 0.016 |
| -1.335000000000078 | 0.359 | 0.046 | 0.006 | 0.129 | 0.017 |
| -1.330000000000078 | 0.361 | 0.047 | 0.006 | 0.13 | 0.017 |
| -1.325000000000078 | 0.363 | 0.048 | 0.006 | 0.132 | 0.017 |
| -1.320000000000078 | 0.365 | 0.048 | 0.006 | 0.133 | 0.018 |
| -1.315000000000079 | 0.366 | 0.049 | 0.007 | 0.134 | 0.018 |
| -1.310000000000079 | 0.368 | 0.05 | 0.007 | 0.136 | 0.018 |
| -1.305000000000079 | 0.37 | 0.051 | 0.007 | 0.137 | 0.019 |
| -1.300000000000079 | 0.372 | 0.051 | 0.007 | 0.138 | 0.019 |
| -1.295000000000079 | 0.374 | 0.052 | 0.007 | 0.14 | 0.019 |
| -1.29000000000008 | 0.375 | 0.053 | 0.007 | 0.141 | 0.02 |
| -1.285000000000079 | 0.377 | 0.054 | 0.008 | 0.142 | 0.02 |
| -1.280000000000079 | 0.379 | 0.054 | 0.008 | 0.144 | 0.021 |
| -1.275000000000079 | 0.381 | 0.055 | 0.008 | 0.145 | 0.021 |
| -1.270000000000079 | 0.383 | 0.056 | 0.008 | 0.146 | 0.021 |
| -1.26500000000008 | 0.385 | 0.057 | 0.008 | 0.148 | 0.022 |
| -1.26000000000008 | 0.386 | 0.058 | 0.009 | 0.149 | 0.022 |
| -1.25500000000008 | 0.388 | 0.059 | 0.009 | 0.151 | 0.023 |
| -1.25000000000008 | 0.39 | 0.059 | 0.009 | 0.152 | 0.023 |
| -1.24500000000008 | 0.392 | 0.06 | 0.009 | 0.154 | 0.024 |
| -1.24000000000008 | 0.394 | 0.061 | 0.01 | 0.155 | 0.024 |
| -1.23500000000008 | 0.396 | 0.062 | 0.01 | 0.157 | 0.025 |
| -1.23000000000008 | 0.398 | 0.063 | 0.01 | 0.158 | 0.025 |
| -1.22500000000008 | 0.4 | 0.064 | 0.01 | 0.16 | 0.026 |
| -1.220000000000081 | 0.402 | 0.065 | 0.01 | 0.161 | 0.026 |
| -1.215000000000081 | 0.404 | 0.066 | 0.011 | 0.163 | 0.027 |
| -1.210000000000081 | 0.406 | 0.067 | 0.011 | 0.165 | 0.027 |
| -1.205000000000081 | 0.408 | 0.068 | 0.011 | 0.166 | 0.028 |
| -1.200000000000081 | 0.41 | 0.069 | 0.012 | 0.168 | 0.028 |
| -1.195000000000081 | 0.412 | 0.07 | 0.012 | 0.17 | 0.029 |
| -1.190000000000081 | 0.414 | 0.071 | 0.012 | 0.171 | 0.029 |
| -1.185000000000081 | 0.416 | 0.072 | 0.012 | 0.173 | 0.03 |
| -1.180000000000081 | 0.418 | 0.073 | 0.013 | 0.175 | 0.031 |
| -1.175000000000082 | 0.42 | 0.074 | 0.013 | 0.176 | 0.031 |
| -1.170000000000082 | 0.422 | 0.075 | 0.013 | 0.178 | 0.032 |
| -1.165000000000082 | 0.424 | 0.076 | 0.014 | 0.18 | 0.032 |
| -1.160000000000082 | 0.426 | 0.077 | 0.014 | 0.182 | 0.033 |
| -1.155000000000082 | 0.428 | 0.079 | 0.014 | 0.184 | 0.034 |
| -1.150000000000082 | 0.431 | 0.08 | 0.015 | 0.185 | 0.034 |
| -1.145000000000082 | 0.433 | 0.081 | 0.015 | 0.187 | 0.035 |
| -1.140000000000082 | 0.435 | 0.082 | 0.016 | 0.189 | 0.036 |
| -1.135000000000082 | 0.437 | 0.083 | 0.016 | 0.191 | 0.036 |
| -1.130000000000082 | 0.439 | 0.085 | 0.016 | 0.193 | 0.037 |
| -1.125000000000083 | 0.441 | 0.086 | 0.017 | 0.195 | 0.038 |
| -1.120000000000083 | 0.444 | 0.087 | 0.017 | 0.197 | 0.039 |
| -1.115000000000083 | 0.446 | 0.089 | 0.018 | 0.199 | 0.039 |
| -1.110000000000083 | 0.448 | 0.09 | 0.018 | 0.201 | 0.04 |
| -1.105000000000083 | 0.45 | 0.091 | 0.019 | 0.203 | 0.041 |
| -1.100000000000083 | 0.452 | 0.093 | 0.019 | 0.205 | 0.042 |
| -1.095000000000083 | 0.455 | 0.094 | 0.019 | 0.207 | 0.043 |
| -1.090000000000083 | 0.457 | 0.095 | 0.02 | 0.209 | 0.044 |
| -1.085000000000083 | 0.459 | 0.097 | 0.02 | 0.211 | 0.045 |
| -1.080000000000084 | 0.462 | 0.098 | 0.021 | 0.213 | 0.045 |
| -1.075000000000084 | 0.464 | 0.1 | 0.021 | 0.215 | 0.046 |
| -1.070000000000084 | 0.466 | 0.101 | 0.022 | 0.217 | 0.047 |
| -1.065000000000084 | 0.469 | 0.103 | 0.023 | 0.22 | 0.048 |
| -1.060000000000084 | 0.471 | 0.104 | 0.023 | 0.222 | 0.049 |
| -1.055000000000084 | 0.473 | 0.106 | 0.024 | 0.224 | 0.05 |
| -1.050000000000084 | 0.476 | 0.108 | 0.024 | 0.226 | 0.051 |
| -1.045000000000084 | 0.478 | 0.109 | 0.025 | 0.228 | 0.052 |
| -1.040000000000084 | 0.48 | 0.111 | 0.026 | 0.231 | 0.053 |
| -1.035000000000085 | 0.483 | 0.113 | 0.026 | 0.233 | 0.054 |
| -1.030000000000085 | 0.485 | 0.114 | 0.027 | 0.235 | 0.055 |
| -1.025000000000085 | 0.488 | 0.116 | 0.028 | 0.238 | 0.057 |
| -1.020000000000085 | 0.49 | 0.118 | 0.028 | 0.24 | 0.058 |
| -1.015000000000085 | 0.493 | 0.119 | 0.029 | 0.243 | 0.059 |
| -1.010000000000085 | 0.495 | 0.121 | 0.03 | 0.245 | 0.06 |
| -1.005000000000085 | 0.498 | 0.123 | 0.03 | 0.248 | 0.061 |
| -1.000000000000085 | 0.5 | 0.125 | 0.031 | 0.25 | 0.062 |
| -0.995000000000085 | 0.503 | 0.127 | 0.032 | 0.253 | 0.064 |
| -0.990000000000085 | 0.505 | 0.129 | 0.033 | 0.255 | 0.065 |
| -0.985000000000085 | 0.508 | 0.131 | 0.034 | 0.258 | 0.066 |
| -0.980000000000085 | 0.51 | 0.133 | 0.035 | 0.26 | 0.068 |
| -0.975000000000085 | 0.513 | 0.135 | 0.035 | 0.263 | 0.069 |
| -0.970000000000085 | 0.515 | 0.137 | 0.036 | 0.265 | 0.07 |
| -0.965000000000085 | 0.518 | 0.139 | 0.037 | 0.268 | 0.072 |
| -0.960000000000085 | 0.52 | 0.141 | 0.038 | 0.271 | 0.073 |
| -0.955000000000085 | 0.523 | 0.143 | 0.039 | 0.274 | 0.075 |
| -0.950000000000085 | 0.526 | 0.145 | 0.04 | 0.276 | 0.076 |
| -0.945000000000085 | 0.528 | 0.147 | 0.041 | 0.279 | 0.078 |
| -0.940000000000085 | 0.531 | 0.15 | 0.042 | 0.282 | 0.079 |
| -0.935000000000085 | 0.534 | 0.152 | 0.043 | 0.285 | 0.081 |
| -0.930000000000085 | 0.536 | 0.154 | 0.044 | 0.288 | 0.083 |
| -0.925000000000085 | 0.539 | 0.157 | 0.045 | 0.29 | 0.084 |
| -0.920000000000085 | 0.542 | 0.159 | 0.047 | 0.293 | 0.086 |
| -0.915000000000085 | 0.544 | 0.161 | 0.048 | 0.296 | 0.088 |
| -0.910000000000085 | 0.547 | 0.164 | 0.049 | 0.299 | 0.09 |
| -0.905000000000085 | 0.55 | 0.166 | 0.05 | 0.302 | 0.091 |
| -0.900000000000085 | 0.552 | 0.169 | 0.051 | 0.305 | 0.093 |
| -0.895000000000085 | 0.555 | 0.171 | 0.053 | 0.308 | 0.095 |
| -0.890000000000085 | 0.558 | 0.174 | 0.054 | 0.311 | 0.097 |
| -0.885000000000085 | 0.561 | 0.176 | 0.055 | 0.314 | 0.099 |
| -0.880000000000085 | 0.564 | 0.179 | 0.057 | 0.318 | 0.101 |
| -0.875000000000085 | 0.566 | 0.182 | 0.058 | 0.321 | 0.103 |
| -0.870000000000085 | 0.569 | 0.184 | 0.06 | 0.324 | 0.105 |
| -0.865000000000085 | 0.572 | 0.187 | 0.061 | 0.327 | 0.107 |
| -0.860000000000085 | 0.575 | 0.19 | 0.063 | 0.33 | 0.109 |
| -0.855000000000085 | 0.578 | 0.193 | 0.064 | 0.334 | 0.111 |
| -0.850000000000085 | 0.581 | 0.196 | 0.066 | 0.337 | 0.114 |
| -0.845000000000085 | 0.583 | 0.199 | 0.068 | 0.34 | 0.116 |
| -0.840000000000085 | 0.586 | 0.202 | 0.069 | 0.344 | 0.118 |
| -0.835000000000085 | 0.589 | 0.205 | 0.071 | 0.347 | 0.121 |
| -0.830000000000085 | 0.592 | 0.208 | 0.073 | 0.351 | 0.123 |
| -0.825000000000085 | 0.595 | 0.211 | 0.075 | 0.354 | 0.125 |
| -0.820000000000085 | 0.598 | 0.214 | 0.076 | 0.358 | 0.128 |
| -0.815000000000085 | 0.601 | 0.217 | 0.078 | 0.361 | 0.13 |
| -0.810000000000085 | 0.604 | 0.22 | 0.08 | 0.365 | 0.133 |
| -0.805000000000085 | 0.607 | 0.223 | 0.082 | 0.368 | 0.136 |
| -0.800000000000085 | 0.61 | 0.227 | 0.084 | 0.372 | 0.138 |
| -0.795000000000085 | 0.613 | 0.23 | 0.086 | 0.375 | 0.141 |
| -0.790000000000085 | 0.616 | 0.233 | 0.088 | 0.379 | 0.144 |
| -0.785000000000085 | 0.619 | 0.237 | 0.091 | 0.383 | 0.147 |
| -0.780000000000085 | 0.622 | 0.24 | 0.093 | 0.387 | 0.149 |
| -0.775000000000085 | 0.625 | 0.244 | 0.095 | 0.39 | 0.152 |
| -0.770000000000085 | 0.628 | 0.247 | 0.098 | 0.394 | 0.155 |
| -0.765000000000085 | 0.631 | 0.251 | 0.1 | 0.398 | 0.158 |
| -0.760000000000085 | 0.634 | 0.255 | 0.102 | 0.402 | 0.161 |
| -0.755000000000085 | 0.637 | 0.258 | 0.105 | 0.406 | 0.165 |
| -0.750000000000085 | 0.64 | 0.262 | 0.107 | 0.41 | 0.168 |
| -0.745000000000085 | 0.643 | 0.266 | 0.11 | 0.414 | 0.171 |
| -0.740000000000085 | 0.646 | 0.27 | 0.113 | 0.418 | 0.174 |
| -0.735000000000085 | 0.649 | 0.274 | 0.115 | 0.422 | 0.178 |
| -0.730000000000085 | 0.652 | 0.278 | 0.118 | 0.426 | 0.181 |
| -0.725000000000085 | 0.655 | 0.282 | 0.121 | 0.43 | 0.185 |
| -0.720000000000085 | 0.659 | 0.286 | 0.124 | 0.434 | 0.188 |
| -0.715000000000085 | 0.662 | 0.29 | 0.127 | 0.438 | 0.192 |
| -0.710000000000085 | 0.665 | 0.294 | 0.13 | 0.442 | 0.195 |
| -0.705000000000085 | 0.668 | 0.298 | 0.133 | 0.446 | 0.199 |
| -0.700000000000085 | 0.671 | 0.302 | 0.136 | 0.45 | 0.203 |
| -0.695000000000085 | 0.674 | 0.307 | 0.139 | 0.455 | 0.207 |
| -0.690000000000085 | 0.677 | 0.311 | 0.143 | 0.459 | 0.211 |
| -0.685000000000085 | 0.681 | 0.315 | 0.146 | 0.463 | 0.215 |
| -0.680000000000085 | 0.684 | 0.32 | 0.15 | 0.468 | 0.219 |
| -0.675000000000085 | 0.687 | 0.324 | 0.153 | 0.472 | 0.223 |
| -0.670000000000085 | 0.69 | 0.329 | 0.157 | 0.476 | 0.227 |
| -0.665000000000085 | 0.693 | 0.333 | 0.16 | 0.481 | 0.231 |
| -0.660000000000085 | 0.697 | 0.338 | 0.164 | 0.485 | 0.235 |
| -0.655000000000085 | 0.7 | 0.343 | 0.168 | 0.49 | 0.24 |
| -0.650000000000085 | 0.703 | 0.347 | 0.172 | 0.494 | 0.244 |
| -0.645000000000085 | 0.706 | 0.352 | 0.176 | 0.499 | 0.249 |
| -0.640000000000085 | 0.709 | 0.357 | 0.18 | 0.503 | 0.253 |
| -0.635000000000085 | 0.713 | 0.362 | 0.184 | 0.508 | 0.258 |
| -0.630000000000085 | 0.716 | 0.367 | 0.188 | 0.512 | 0.263 |
| -0.625000000000085 | 0.719 | 0.372 | 0.192 | 0.517 | 0.267 |
| -0.620000000000085 | 0.722 | 0.377 | 0.197 | 0.522 | 0.272 |
| -0.615000000000085 | 0.726 | 0.382 | 0.201 | 0.526 | 0.277 |
| -0.610000000000085 | 0.729 | 0.387 | 0.206 | 0.531 | 0.282 |
| -0.605000000000085 | 0.732 | 0.392 | 0.21 | 0.536 | 0.287 |
| -0.600000000000085 | 0.735 | 0.398 | 0.215 | 0.541 | 0.292 |
| -0.595000000000085 | 0.739 | 0.403 | 0.22 | 0.545 | 0.298 |
| -0.590000000000085 | 0.742 | 0.408 | 0.225 | 0.55 | 0.303 |
| -0.585000000000085 | 0.745 | 0.414 | 0.23 | 0.555 | 0.308 |
| -0.580000000000085 | 0.748 | 0.419 | 0.235 | 0.56 | 0.314 |
| -0.575000000000085 | 0.752 | 0.424 | 0.24 | 0.565 | 0.319 |
| -0.570000000000085 | 0.755 | 0.43 | 0.245 | 0.57 | 0.325 |
| -0.565000000000085 | 0.758 | 0.436 | 0.25 | 0.575 | 0.33 |
| -0.560000000000085 | 0.761 | 0.441 | 0.256 | 0.58 | 0.336 |
| -0.555000000000085 | 0.765 | 0.447 | 0.261 | 0.584 | 0.342 |
| -0.550000000000085 | 0.768 | 0.453 | 0.267 | 0.589 | 0.347 |
| -0.545000000000085 | 0.771 | 0.458 | 0.272 | 0.594 | 0.353 |
| -0.540000000000085 | 0.774 | 0.464 | 0.278 | 0.599 | 0.359 |
| -0.535000000000085 | 0.777 | 0.47 | 0.284 | 0.604 | 0.365 |
| -0.530000000000085 | 0.781 | 0.476 | 0.29 | 0.609 | 0.371 |
| -0.525000000000085 | 0.784 | 0.482 | 0.296 | 0.615 | 0.378 |
| -0.520000000000085 | 0.787 | 0.488 | 0.302 | 0.62 | 0.384 |
| -0.515000000000085 | 0.79 | 0.494 | 0.308 | 0.625 | 0.39 |
| -0.510000000000085 | 0.794 | 0.5 | 0.315 | 0.63 | 0.397 |
| -0.505000000000085 | 0.797 | 0.506 | 0.321 | 0.635 | 0.403 |
| -0.500000000000085 | 0.8 | 0.512 | 0.328 | 0.64 | 0.41 |
| -0.495000000000085 | 0.803 | 0.518 | 0.334 | 0.645 | 0.416 |
| -0.490000000000085 | 0.806 | 0.524 | 0.341 | 0.65 | 0.423 |
| -0.485000000000085 | 0.81 | 0.531 | 0.348 | 0.655 | 0.43 |
| -0.480000000000085 | 0.813 | 0.537 | 0.355 | 0.661 | 0.436 |
| -0.475000000000085 | 0.816 | 0.543 | 0.362 | 0.666 | 0.443 |
| -0.470000000000085 | 0.819 | 0.549 | 0.369 | 0.671 | 0.45 |
| -0.465000000000085 | 0.822 | 0.556 | 0.376 | 0.676 | 0.457 |
| -0.460000000000085 | 0.825 | 0.562 | 0.383 | 0.681 | 0.464 |
| -0.455000000000085 | 0.828 | 0.569 | 0.39 | 0.686 | 0.471 |
| -0.450000000000085 | 0.832 | 0.575 | 0.398 | 0.692 | 0.478 |
| -0.445000000000085 | 0.835 | 0.582 | 0.405 | 0.697 | 0.485 |
| -0.440000000000085 | 0.838 | 0.588 | 0.413 | 0.702 | 0.493 |
| -0.435000000000085 | 0.841 | 0.595 | 0.42 | 0.707 | 0.5 |
| -0.430000000000085 | 0.844 | 0.601 | 0.428 | 0.712 | 0.507 |
| -0.425000000000085 | 0.847 | 0.608 | 0.436 | 0.717 | 0.515 |
| -0.420000000000085 | 0.85 | 0.614 | 0.444 | 0.723 | 0.522 |
| -0.415000000000085 | 0.853 | 0.621 | 0.452 | 0.728 | 0.53 |
| -0.410000000000085 | 0.856 | 0.627 | 0.46 | 0.733 | 0.537 |
| -0.405000000000085 | 0.859 | 0.634 | 0.468 | 0.738 | 0.545 |
| -0.400000000000085 | 0.862 | 0.641 | 0.476 | 0.743 | 0.552 |
| -0.395000000000085 | 0.865 | 0.647 | 0.484 | 0.748 | 0.56 |
| -0.390000000000085 | 0.868 | 0.654 | 0.493 | 0.753 | 0.568 |
| -0.385000000000085 | 0.871 | 0.661 | 0.501 | 0.758 | 0.575 |
| -0.380000000000085 | 0.874 | 0.667 | 0.509 | 0.764 | 0.583 |
| -0.375000000000085 | 0.877 | 0.674 | 0.518 | 0.769 | 0.591 |
| -0.370000000000085 | 0.88 | 0.681 | 0.526 | 0.774 | 0.599 |
| -0.365000000000085 | 0.882 | 0.687 | 0.535 | 0.779 | 0.606 |
| -0.360000000000085 | 0.885 | 0.694 | 0.544 | 0.784 | 0.614 |
| -0.355000000000085 | 0.888 | 0.7 | 0.552 | 0.789 | 0.622 |
| -0.350000000000085 | 0.891 | 0.707 | 0.561 | 0.794 | 0.63 |
| -0.345000000000085 | 0.894 | 0.714 | 0.57 | 0.799 | 0.638 |
| -0.340000000000085 | 0.896 | 0.72 | 0.579 | 0.803 | 0.646 |
| -0.335000000000085 | 0.899 | 0.727 | 0.588 | 0.808 | 0.653 |
| -0.330000000000085 | 0.902 | 0.733 | 0.596 | 0.813 | 0.661 |
| -0.325000000000085 | 0.904 | 0.74 | 0.605 | 0.818 | 0.669 |
| -0.320000000000085 | 0.907 | 0.746 | 0.614 | 0.823 | 0.677 |
| -0.315000000000085 | 0.91 | 0.753 | 0.623 | 0.828 | 0.685 |
| -0.310000000000085 | 0.912 | 0.759 | 0.632 | 0.832 | 0.693 |
| -0.305000000000085 | 0.915 | 0.766 | 0.641 | 0.837 | 0.701 |
| -0.300000000000085 | 0.917 | 0.772 | 0.65 | 0.842 | 0.708 |
| -0.295000000000085 | 0.92 | 0.779 | 0.659 | 0.846 | 0.716 |
| -0.290000000000085 | 0.922 | 0.785 | 0.668 | 0.851 | 0.724 |
| -0.285000000000085 | 0.925 | 0.791 | 0.677 | 0.855 | 0.732 |
| -0.280000000000085 | 0.927 | 0.797 | 0.686 | 0.86 | 0.739 |
| -0.275000000000085 | 0.93 | 0.804 | 0.695 | 0.864 | 0.747 |
| -0.270000000000085 | 0.932 | 0.81 | 0.703 | 0.869 | 0.755 |
| -0.265000000000085 | 0.934 | 0.816 | 0.712 | 0.873 | 0.762 |
| -0.260000000000085 | 0.937 | 0.822 | 0.721 | 0.877 | 0.77 |
| -0.255000000000085 | 0.939 | 0.828 | 0.73 | 0.882 | 0.777 |
| -0.250000000000085 | 0.941 | 0.834 | 0.739 | 0.886 | 0.785 |
| -0.245000000000085 | 0.943 | 0.84 | 0.747 | 0.89 | 0.792 |
| -0.240000000000085 | 0.946 | 0.845 | 0.756 | 0.894 | 0.799 |
| -0.235000000000085 | 0.948 | 0.851 | 0.764 | 0.898 | 0.807 |
| -0.230000000000085 | 0.95 | 0.857 | 0.773 | 0.902 | 0.814 |
| -0.225000000000085 | 0.952 | 0.862 | 0.781 | 0.906 | 0.821 |
| -0.220000000000085 | 0.954 | 0.868 | 0.79 | 0.91 | 0.828 |
| -0.215000000000085 | 0.956 | 0.873 | 0.798 | 0.914 | 0.835 |
| -0.210000000000085 | 0.958 | 0.879 | 0.806 | 0.917 | 0.841 |
| -0.205000000000085 | 0.96 | 0.884 | 0.814 | 0.921 | 0.848 |
| -0.200000000000085 | 0.962 | 0.889 | 0.822 | 0.925 | 0.855 |
| -0.195000000000085 | 0.963 | 0.894 | 0.83 | 0.928 | 0.861 |
| -0.190000000000085 | 0.965 | 0.899 | 0.838 | 0.932 | 0.868 |
| -0.185000000000085 | 0.967 | 0.904 | 0.845 | 0.935 | 0.874 |
| -0.180000000000085 | 0.969 | 0.909 | 0.853 | 0.938 | 0.88 |
| -0.175000000000085 | 0.97 | 0.913 | 0.86 | 0.941 | 0.886 |
| -0.170000000000085 | 0.972 | 0.918 | 0.867 | 0.945 | 0.892 |
| -0.165000000000085 | 0.973 | 0.923 | 0.874 | 0.948 | 0.898 |
| -0.160000000000085 | 0.975 | 0.927 | 0.881 | 0.951 | 0.904 |
| -0.155000000000084 | 0.977 | 0.931 | 0.888 | 0.954 | 0.909 |
| -0.150000000000084 | 0.978 | 0.935 | 0.895 | 0.956 | 0.915 |
| -0.145000000000084 | 0.979 | 0.939 | 0.901 | 0.959 | 0.92 |
| -0.140000000000084 | 0.981 | 0.943 | 0.908 | 0.962 | 0.925 |
| -0.135000000000084 | 0.982 | 0.947 | 0.914 | 0.965 | 0.93 |
| -0.130000000000084 | 0.983 | 0.951 | 0.92 | 0.967 | 0.935 |
| -0.125000000000084 | 0.985 | 0.955 | 0.925 | 0.969 | 0.94 |
| -0.120000000000084 | 0.986 | 0.958 | 0.931 | 0.972 | 0.944 |
| -0.115000000000084 | 0.987 | 0.961 | 0.936 | 0.974 | 0.949 |
| -0.110000000000084 | 0.988 | 0.965 | 0.942 | 0.976 | 0.953 |
| -0.105000000000084 | 0.989 | 0.968 | 0.947 | 0.978 | 0.957 |
| -0.100000000000084 | 0.99 | 0.971 | 0.951 | 0.98 | 0.961 |
| -0.0950000000000844 | 0.991 | 0.973 | 0.956 | 0.982 | 0.965 |
| -0.0900000000000844 | 0.992 | 0.976 | 0.96 | 0.984 | 0.968 |
| -0.0850000000000844 | 0.993 | 0.979 | 0.965 | 0.986 | 0.972 |
| -0.0800000000000844 | 0.994 | 0.981 | 0.969 | 0.987 | 0.975 |
| -0.0750000000000844 | 0.994 | 0.983 | 0.972 | 0.989 | 0.978 |
| -0.0700000000000844 | 0.995 | 0.985 | 0.976 | 0.99 | 0.981 |
| -0.0650000000000844 | 0.996 | 0.987 | 0.979 | 0.992 | 0.983 |
| -0.0600000000000844 | 0.996 | 0.989 | 0.982 | 0.993 | 0.986 |
| -0.0550000000000844 | 0.997 | 0.991 | 0.985 | 0.994 | 0.988 |
| -0.0500000000000844 | 0.998 | 0.993 | 0.988 | 0.995 | 0.99 |
| -0.0450000000000844 | 0.998 | 0.994 | 0.99 | 0.996 | 0.992 |
| -0.0400000000000844 | 0.998 | 0.995 | 0.992 | 0.997 | 0.994 |
| -0.0350000000000844 | 0.999 | 0.996 | 0.994 | 0.998 | 0.995 |
| -0.0300000000000844 | 0.999 | 0.997 | 0.996 | 0.998 | 0.996 |
| -0.0250000000000844 | 0.999 | 0.998 | 0.997 | 0.999 | 0.998 |
| -0.0200000000000844 | 1 | 0.999 | 0.998 | 0.999 | 0.998 |
| -0.0150000000000844 | 1 | 0.999 | 0.999 | 1 | 0.999 |
| -0.0100000000000844 | 1 | 1 | 1 | 1 | 1 |
| -0.00500000000008444 | 1 | 1 | 1 | 1 | 1 |
| -8.4444604087075e-14 | 1 | 1 | 1 | 1 | 1 |
| 0.00499999999991555 | 1 | 1 | 1 | 1 | 1 |
| 0.00999999999991555 | 1 | 1 | 1 | 1 | 1 |
| 0.0149999999999156 | 1 | 0.999 | 0.999 | 1 | 0.999 |
| 0.0199999999999156 | 1 | 0.999 | 0.998 | 0.999 | 0.998 |
| 0.0249999999999156 | 0.999 | 0.998 | 0.997 | 0.999 | 0.998 |
| 0.0299999999999156 | 0.999 | 0.997 | 0.996 | 0.998 | 0.996 |
| 0.0349999999999155 | 0.999 | 0.996 | 0.994 | 0.998 | 0.995 |
| 0.0399999999999155 | 0.998 | 0.995 | 0.992 | 0.997 | 0.994 |
| 0.0449999999999155 | 0.998 | 0.994 | 0.99 | 0.996 | 0.992 |
| 0.0499999999999155 | 0.998 | 0.993 | 0.988 | 0.995 | 0.99 |
| 0.0549999999999155 | 0.997 | 0.991 | 0.985 | 0.994 | 0.988 |
| 0.0599999999999155 | 0.996 | 0.989 | 0.982 | 0.993 | 0.986 |
| 0.0649999999999155 | 0.996 | 0.987 | 0.979 | 0.992 | 0.983 |
| 0.0699999999999155 | 0.995 | 0.985 | 0.976 | 0.99 | 0.981 |
| 0.0749999999999155 | 0.994 | 0.983 | 0.972 | 0.989 | 0.978 |
| 0.0799999999999155 | 0.994 | 0.981 | 0.969 | 0.987 | 0.975 |
| 0.0849999999999155 | 0.993 | 0.979 | 0.965 | 0.986 | 0.972 |
| 0.0899999999999155 | 0.992 | 0.976 | 0.96 | 0.984 | 0.968 |
| 0.0949999999999155 | 0.991 | 0.973 | 0.956 | 0.982 | 0.965 |
| 0.0999999999999155 | 0.99 | 0.971 | 0.951 | 0.98 | 0.961 |
| 0.104999999999916 | 0.989 | 0.968 | 0.947 | 0.978 | 0.957 |
| 0.109999999999916 | 0.988 | 0.965 | 0.942 | 0.976 | 0.953 |
| 0.114999999999916 | 0.987 | 0.961 | 0.936 | 0.974 | 0.949 |
| 0.119999999999916 | 0.986 | 0.958 | 0.931 | 0.972 | 0.944 |
| 0.124999999999916 | 0.985 | 0.955 | 0.925 | 0.969 | 0.94 |
| 0.129999999999916 | 0.983 | 0.951 | 0.92 | 0.967 | 0.935 |
| 0.134999999999916 | 0.982 | 0.947 | 0.914 | 0.965 | 0.93 |
| 0.139999999999916 | 0.981 | 0.943 | 0.908 | 0.962 | 0.925 |
| 0.144999999999916 | 0.979 | 0.939 | 0.901 | 0.959 | 0.92 |
| 0.149999999999916 | 0.978 | 0.935 | 0.895 | 0.956 | 0.915 |
| 0.154999999999916 | 0.977 | 0.931 | 0.888 | 0.954 | 0.909 |
| 0.159999999999916 | 0.975 | 0.927 | 0.881 | 0.951 | 0.904 |
| 0.164999999999916 | 0.973 | 0.923 | 0.874 | 0.948 | 0.898 |
| 0.169999999999916 | 0.972 | 0.918 | 0.867 | 0.945 | 0.892 |
| 0.174999999999916 | 0.97 | 0.913 | 0.86 | 0.941 | 0.886 |
| 0.179999999999916 | 0.969 | 0.909 | 0.853 | 0.938 | 0.88 |
| 0.184999999999916 | 0.967 | 0.904 | 0.845 | 0.935 | 0.874 |
| 0.189999999999916 | 0.965 | 0.899 | 0.838 | 0.932 | 0.868 |
| 0.194999999999916 | 0.963 | 0.894 | 0.83 | 0.928 | 0.861 |
| 0.199999999999916 | 0.962 | 0.889 | 0.822 | 0.925 | 0.855 |
| 0.204999999999916 | 0.96 | 0.884 | 0.814 | 0.921 | 0.848 |
| 0.209999999999916 | 0.958 | 0.879 | 0.806 | 0.917 | 0.841 |
| 0.214999999999916 | 0.956 | 0.873 | 0.798 | 0.914 | 0.835 |
| 0.219999999999916 | 0.954 | 0.868 | 0.79 | 0.91 | 0.828 |
| 0.224999999999916 | 0.952 | 0.862 | 0.781 | 0.906 | 0.821 |
| 0.229999999999916 | 0.95 | 0.857 | 0.773 | 0.902 | 0.814 |
| 0.234999999999916 | 0.948 | 0.851 | 0.764 | 0.898 | 0.807 |
| 0.239999999999916 | 0.946 | 0.845 | 0.756 | 0.894 | 0.799 |
| 0.244999999999916 | 0.943 | 0.84 | 0.747 | 0.89 | 0.792 |
| 0.249999999999916 | 0.941 | 0.834 | 0.739 | 0.886 | 0.785 |
| 0.254999999999916 | 0.939 | 0.828 | 0.73 | 0.882 | 0.777 |
| 0.259999999999916 | 0.937 | 0.822 | 0.721 | 0.877 | 0.77 |
| 0.264999999999916 | 0.934 | 0.816 | 0.712 | 0.873 | 0.762 |
| 0.269999999999916 | 0.932 | 0.81 | 0.703 | 0.869 | 0.755 |
| 0.274999999999916 | 0.93 | 0.804 | 0.695 | 0.864 | 0.747 |
| 0.279999999999916 | 0.927 | 0.797 | 0.686 | 0.86 | 0.739 |
| 0.284999999999916 | 0.925 | 0.791 | 0.677 | 0.855 | 0.732 |
| 0.289999999999916 | 0.922 | 0.785 | 0.668 | 0.851 | 0.724 |
| 0.294999999999916 | 0.92 | 0.779 | 0.659 | 0.846 | 0.716 |
| 0.299999999999916 | 0.917 | 0.772 | 0.65 | 0.842 | 0.708 |
| 0.304999999999916 | 0.915 | 0.766 | 0.641 | 0.837 | 0.701 |
| 0.309999999999916 | 0.912 | 0.759 | 0.632 | 0.832 | 0.693 |
| 0.314999999999916 | 0.91 | 0.753 | 0.623 | 0.828 | 0.685 |
| 0.319999999999916 | 0.907 | 0.746 | 0.614 | 0.823 | 0.677 |
| 0.324999999999916 | 0.904 | 0.74 | 0.605 | 0.818 | 0.669 |
| 0.329999999999916 | 0.902 | 0.733 | 0.596 | 0.813 | 0.661 |
| 0.334999999999916 | 0.899 | 0.727 | 0.588 | 0.808 | 0.653 |
| 0.339999999999916 | 0.896 | 0.72 | 0.579 | 0.803 | 0.646 |
| 0.344999999999916 | 0.894 | 0.714 | 0.57 | 0.799 | 0.638 |
| 0.349999999999916 | 0.891 | 0.707 | 0.561 | 0.794 | 0.63 |
| 0.354999999999916 | 0.888 | 0.7 | 0.552 | 0.789 | 0.622 |
| 0.359999999999916 | 0.885 | 0.694 | 0.544 | 0.784 | 0.614 |
| 0.364999999999916 | 0.882 | 0.687 | 0.535 | 0.779 | 0.606 |
| 0.369999999999916 | 0.88 | 0.681 | 0.526 | 0.774 | 0.599 |
| 0.374999999999916 | 0.877 | 0.674 | 0.518 | 0.769 | 0.591 |
| 0.379999999999916 | 0.874 | 0.667 | 0.509 | 0.764 | 0.583 |
| 0.384999999999916 | 0.871 | 0.661 | 0.501 | 0.758 | 0.575 |
| 0.389999999999916 | 0.868 | 0.654 | 0.493 | 0.753 | 0.568 |
| 0.394999999999916 | 0.865 | 0.647 | 0.484 | 0.748 | 0.56 |
| 0.399999999999916 | 0.862 | 0.641 | 0.476 | 0.743 | 0.552 |
| 0.404999999999916 | 0.859 | 0.634 | 0.468 | 0.738 | 0.545 |
| 0.409999999999916 | 0.856 | 0.627 | 0.46 | 0.733 | 0.537 |
| 0.414999999999916 | 0.853 | 0.621 | 0.452 | 0.728 | 0.53 |
| 0.419999999999916 | 0.85 | 0.614 | 0.444 | 0.723 | 0.522 |
| 0.424999999999916 | 0.847 | 0.608 | 0.436 | 0.717 | 0.515 |
| 0.429999999999916 | 0.844 | 0.601 | 0.428 | 0.712 | 0.507 |
| 0.434999999999916 | 0.841 | 0.595 | 0.42 | 0.707 | 0.5 |
| 0.439999999999916 | 0.838 | 0.588 | 0.413 | 0.702 | 0.493 |
| 0.444999999999916 | 0.835 | 0.582 | 0.405 | 0.697 | 0.485 |
| 0.449999999999916 | 0.832 | 0.575 | 0.398 | 0.692 | 0.478 |
| 0.454999999999916 | 0.828 | 0.569 | 0.39 | 0.686 | 0.471 |
| 0.459999999999916 | 0.825 | 0.562 | 0.383 | 0.681 | 0.464 |
| 0.464999999999916 | 0.822 | 0.556 | 0.376 | 0.676 | 0.457 |
| 0.469999999999916 | 0.819 | 0.549 | 0.369 | 0.671 | 0.45 |
| 0.474999999999916 | 0.816 | 0.543 | 0.362 | 0.666 | 0.443 |
| 0.479999999999916 | 0.813 | 0.537 | 0.355 | 0.661 | 0.436 |
| 0.484999999999916 | 0.81 | 0.531 | 0.348 | 0.655 | 0.43 |
| 0.489999999999916 | 0.806 | 0.524 | 0.341 | 0.65 | 0.423 |
| 0.494999999999916 | 0.803 | 0.518 | 0.334 | 0.645 | 0.416 |
| 0.499999999999916 | 0.8 | 0.512 | 0.328 | 0.64 | 0.41 |
| 0.504999999999916 | 0.797 | 0.506 | 0.321 | 0.635 | 0.403 |
| 0.509999999999916 | 0.794 | 0.5 | 0.315 | 0.63 | 0.397 |
| 0.514999999999916 | 0.79 | 0.494 | 0.308 | 0.625 | 0.39 |
| 0.519999999999916 | 0.787 | 0.488 | 0.302 | 0.62 | 0.384 |
| 0.524999999999916 | 0.784 | 0.482 | 0.296 | 0.615 | 0.378 |
| 0.529999999999916 | 0.781 | 0.476 | 0.29 | 0.609 | 0.371 |
| 0.534999999999916 | 0.777 | 0.47 | 0.284 | 0.604 | 0.365 |
| 0.539999999999916 | 0.774 | 0.464 | 0.278 | 0.599 | 0.359 |
| 0.544999999999916 | 0.771 | 0.458 | 0.272 | 0.594 | 0.353 |
| 0.549999999999916 | 0.768 | 0.453 | 0.267 | 0.589 | 0.347 |
| 0.554999999999916 | 0.765 | 0.447 | 0.261 | 0.584 | 0.342 |
| 0.559999999999916 | 0.761 | 0.441 | 0.256 | 0.58 | 0.336 |
| 0.564999999999916 | 0.758 | 0.436 | 0.25 | 0.575 | 0.33 |
| 0.569999999999916 | 0.755 | 0.43 | 0.245 | 0.57 | 0.325 |
| 0.574999999999916 | 0.752 | 0.424 | 0.24 | 0.565 | 0.319 |
| 0.579999999999916 | 0.748 | 0.419 | 0.235 | 0.56 | 0.314 |
| 0.584999999999916 | 0.745 | 0.414 | 0.23 | 0.555 | 0.308 |
| 0.589999999999916 | 0.742 | 0.408 | 0.225 | 0.55 | 0.303 |
| 0.594999999999916 | 0.739 | 0.403 | 0.22 | 0.545 | 0.298 |
| 0.599999999999916 | 0.735 | 0.398 | 0.215 | 0.541 | 0.292 |
| 0.604999999999916 | 0.732 | 0.392 | 0.21 | 0.536 | 0.287 |
| 0.609999999999916 | 0.729 | 0.387 | 0.206 | 0.531 | 0.282 |
| 0.614999999999916 | 0.726 | 0.382 | 0.201 | 0.526 | 0.277 |
| 0.619999999999916 | 0.722 | 0.377 | 0.197 | 0.522 | 0.272 |
| 0.624999999999916 | 0.719 | 0.372 | 0.192 | 0.517 | 0.267 |
| 0.629999999999916 | 0.716 | 0.367 | 0.188 | 0.512 | 0.263 |
| 0.634999999999916 | 0.713 | 0.362 | 0.184 | 0.508 | 0.258 |
| 0.639999999999916 | 0.709 | 0.357 | 0.18 | 0.503 | 0.253 |
| 0.644999999999916 | 0.706 | 0.352 | 0.176 | 0.499 | 0.249 |
| 0.649999999999916 | 0.703 | 0.347 | 0.172 | 0.494 | 0.244 |
| 0.654999999999916 | 0.7 | 0.343 | 0.168 | 0.49 | 0.24 |
| 0.659999999999916 | 0.697 | 0.338 | 0.164 | 0.485 | 0.235 |
| 0.664999999999916 | 0.693 | 0.333 | 0.16 | 0.481 | 0.231 |
| 0.669999999999916 | 0.69 | 0.329 | 0.157 | 0.476 | 0.227 |
| 0.674999999999916 | 0.687 | 0.324 | 0.153 | 0.472 | 0.223 |
| 0.679999999999916 | 0.684 | 0.32 | 0.15 | 0.468 | 0.219 |
| 0.684999999999916 | 0.681 | 0.315 | 0.146 | 0.463 | 0.215 |
| 0.689999999999916 | 0.677 | 0.311 | 0.143 | 0.459 | 0.211 |
| 0.694999999999916 | 0.674 | 0.307 | 0.139 | 0.455 | 0.207 |
| 0.699999999999916 | 0.671 | 0.302 | 0.136 | 0.45 | 0.203 |
| 0.704999999999916 | 0.668 | 0.298 | 0.133 | 0.446 | 0.199 |
| 0.709999999999916 | 0.665 | 0.294 | 0.13 | 0.442 | 0.195 |
| 0.714999999999916 | 0.662 | 0.29 | 0.127 | 0.438 | 0.192 |
| 0.719999999999916 | 0.659 | 0.286 | 0.124 | 0.434 | 0.188 |
| 0.724999999999916 | 0.655 | 0.282 | 0.121 | 0.43 | 0.185 |
| 0.729999999999916 | 0.652 | 0.278 | 0.118 | 0.426 | 0.181 |
| 0.734999999999916 | 0.649 | 0.274 | 0.115 | 0.422 | 0.178 |
| 0.739999999999916 | 0.646 | 0.27 | 0.113 | 0.418 | 0.174 |
| 0.744999999999916 | 0.643 | 0.266 | 0.11 | 0.414 | 0.171 |
| 0.749999999999916 | 0.64 | 0.262 | 0.107 | 0.41 | 0.168 |
| 0.754999999999916 | 0.637 | 0.258 | 0.105 | 0.406 | 0.165 |
| 0.759999999999916 | 0.634 | 0.255 | 0.102 | 0.402 | 0.161 |
| 0.764999999999916 | 0.631 | 0.251 | 0.1 | 0.398 | 0.158 |
| 0.769999999999916 | 0.628 | 0.247 | 0.098 | 0.394 | 0.155 |
| 0.774999999999916 | 0.625 | 0.244 | 0.095 | 0.39 | 0.152 |
| 0.779999999999916 | 0.622 | 0.24 | 0.093 | 0.387 | 0.149 |
| 0.784999999999916 | 0.619 | 0.237 | 0.091 | 0.383 | 0.147 |
| 0.789999999999916 | 0.616 | 0.233 | 0.088 | 0.379 | 0.144 |
| 0.794999999999916 | 0.613 | 0.23 | 0.086 | 0.375 | 0.141 |
| 0.799999999999916 | 0.61 | 0.227 | 0.084 | 0.372 | 0.138 |
| 0.804999999999916 | 0.607 | 0.223 | 0.082 | 0.368 | 0.136 |
| 0.809999999999916 | 0.604 | 0.22 | 0.08 | 0.365 | 0.133 |
| 0.814999999999916 | 0.601 | 0.217 | 0.078 | 0.361 | 0.13 |
| 0.819999999999916 | 0.598 | 0.214 | 0.076 | 0.358 | 0.128 |
| 0.824999999999916 | 0.595 | 0.211 | 0.075 | 0.354 | 0.125 |
| 0.829999999999916 | 0.592 | 0.208 | 0.073 | 0.351 | 0.123 |
| 0.834999999999916 | 0.589 | 0.205 | 0.071 | 0.347 | 0.121 |
| 0.839999999999916 | 0.586 | 0.202 | 0.069 | 0.344 | 0.118 |
| 0.844999999999916 | 0.583 | 0.199 | 0.068 | 0.34 | 0.116 |
| 0.849999999999916 | 0.581 | 0.196 | 0.066 | 0.337 | 0.114 |
| 0.854999999999916 | 0.578 | 0.193 | 0.064 | 0.334 | 0.111 |
| 0.859999999999916 | 0.575 | 0.19 | 0.063 | 0.33 | 0.109 |
| 0.864999999999916 | 0.572 | 0.187 | 0.061 | 0.327 | 0.107 |
| 0.869999999999916 | 0.569 | 0.184 | 0.06 | 0.324 | 0.105 |
| 0.874999999999916 | 0.566 | 0.182 | 0.058 | 0.321 | 0.103 |
| 0.879999999999916 | 0.564 | 0.179 | 0.057 | 0.318 | 0.101 |
| 0.884999999999916 | 0.561 | 0.176 | 0.055 | 0.314 | 0.099 |
| 0.889999999999916 | 0.558 | 0.174 | 0.054 | 0.311 | 0.097 |
| 0.894999999999916 | 0.555 | 0.171 | 0.053 | 0.308 | 0.095 |
| 0.899999999999916 | 0.552 | 0.169 | 0.051 | 0.305 | 0.093 |
| 0.904999999999916 | 0.55 | 0.166 | 0.05 | 0.302 | 0.091 |
| 0.909999999999916 | 0.547 | 0.164 | 0.049 | 0.299 | 0.09 |
| 0.914999999999916 | 0.544 | 0.161 | 0.048 | 0.296 | 0.088 |
| 0.919999999999916 | 0.542 | 0.159 | 0.047 | 0.293 | 0.086 |
| 0.924999999999916 | 0.539 | 0.157 | 0.045 | 0.29 | 0.084 |
| 0.929999999999916 | 0.536 | 0.154 | 0.044 | 0.288 | 0.083 |
| 0.934999999999916 | 0.534 | 0.152 | 0.043 | 0.285 | 0.081 |
| 0.939999999999916 | 0.531 | 0.15 | 0.042 | 0.282 | 0.079 |
| 0.944999999999916 | 0.528 | 0.147 | 0.041 | 0.279 | 0.078 |
| 0.949999999999916 | 0.526 | 0.145 | 0.04 | 0.276 | 0.076 |
| 0.954999999999916 | 0.523 | 0.143 | 0.039 | 0.274 | 0.075 |
| 0.959999999999916 | 0.52 | 0.141 | 0.038 | 0.271 | 0.073 |
| 0.964999999999916 | 0.518 | 0.139 | 0.037 | 0.268 | 0.072 |
| 0.969999999999916 | 0.515 | 0.137 | 0.036 | 0.265 | 0.07 |
| 0.974999999999916 | 0.513 | 0.135 | 0.035 | 0.263 | 0.069 |
| 0.979999999999916 | 0.51 | 0.133 | 0.035 | 0.26 | 0.068 |
| 0.984999999999916 | 0.508 | 0.131 | 0.034 | 0.258 | 0.066 |
| 0.989999999999916 | 0.505 | 0.129 | 0.033 | 0.255 | 0.065 |
| 0.994999999999916 | 0.503 | 0.127 | 0.032 | 0.253 | 0.064 |
| 0.999999999999916 | 0.5 | 0.125 | 0.031 | 0.25 | 0.063 |
| 1.004999999999916 | 0.498 | 0.123 | 0.03 | 0.248 | 0.061 |
| 1.009999999999916 | 0.495 | 0.121 | 0.03 | 0.245 | 0.06 |
| 1.014999999999916 | 0.493 | 0.119 | 0.029 | 0.243 | 0.059 |
| 1.019999999999916 | 0.49 | 0.118 | 0.028 | 0.24 | 0.058 |
| 1.024999999999916 | 0.488 | 0.116 | 0.028 | 0.238 | 0.057 |
| 1.029999999999916 | 0.485 | 0.114 | 0.027 | 0.235 | 0.055 |
| 1.034999999999916 | 0.483 | 0.113 | 0.026 | 0.233 | 0.054 |
| 1.039999999999915 | 0.48 | 0.111 | 0.026 | 0.231 | 0.053 |
| 1.044999999999915 | 0.478 | 0.109 | 0.025 | 0.228 | 0.052 |
| 1.049999999999915 | 0.476 | 0.108 | 0.024 | 0.226 | 0.051 |
| 1.054999999999915 | 0.473 | 0.106 | 0.024 | 0.224 | 0.05 |
| 1.059999999999915 | 0.471 | 0.104 | 0.023 | 0.222 | 0.049 |
| 1.064999999999915 | 0.469 | 0.103 | 0.023 | 0.22 | 0.048 |
| 1.069999999999915 | 0.466 | 0.101 | 0.022 | 0.217 | 0.047 |
| 1.074999999999915 | 0.464 | 0.1 | 0.021 | 0.215 | 0.046 |
| 1.079999999999915 | 0.462 | 0.098 | 0.021 | 0.213 | 0.045 |
| 1.084999999999914 | 0.459 | 0.097 | 0.02 | 0.211 | 0.045 |
| 1.089999999999914 | 0.457 | 0.095 | 0.02 | 0.209 | 0.044 |
| 1.094999999999914 | 0.455 | 0.094 | 0.019 | 0.207 | 0.043 |
| 1.099999999999914 | 0.452 | 0.093 | 0.019 | 0.205 | 0.042 |
| 1.104999999999914 | 0.45 | 0.091 | 0.019 | 0.203 | 0.041 |
| 1.109999999999914 | 0.448 | 0.09 | 0.018 | 0.201 | 0.04 |
| 1.114999999999914 | 0.446 | 0.089 | 0.018 | 0.199 | 0.039 |
| 1.119999999999914 | 0.444 | 0.087 | 0.017 | 0.197 | 0.039 |
| 1.124999999999914 | 0.441 | 0.086 | 0.017 | 0.195 | 0.038 |
| 1.129999999999914 | 0.439 | 0.085 | 0.016 | 0.193 | 0.037 |
| 1.134999999999913 | 0.437 | 0.083 | 0.016 | 0.191 | 0.036 |
| 1.139999999999913 | 0.435 | 0.082 | 0.016 | 0.189 | 0.036 |
| 1.144999999999913 | 0.433 | 0.081 | 0.015 | 0.187 | 0.035 |
| 1.149999999999913 | 0.431 | 0.08 | 0.015 | 0.185 | 0.034 |
| 1.154999999999913 | 0.428 | 0.079 | 0.014 | 0.184 | 0.034 |
| 1.159999999999913 | 0.426 | 0.077 | 0.014 | 0.182 | 0.033 |
| 1.164999999999913 | 0.424 | 0.076 | 0.014 | 0.18 | 0.032 |
| 1.169999999999913 | 0.422 | 0.075 | 0.013 | 0.178 | 0.032 |
| 1.174999999999913 | 0.42 | 0.074 | 0.013 | 0.176 | 0.031 |
| 1.179999999999912 | 0.418 | 0.073 | 0.013 | 0.175 | 0.031 |
| 1.184999999999912 | 0.416 | 0.072 | 0.012 | 0.173 | 0.03 |
| 1.189999999999912 | 0.414 | 0.071 | 0.012 | 0.171 | 0.029 |
| 1.194999999999912 | 0.412 | 0.07 | 0.012 | 0.17 | 0.029 |
| 1.199999999999912 | 0.41 | 0.069 | 0.012 | 0.168 | 0.028 |
| 1.204999999999912 | 0.408 | 0.068 | 0.011 | 0.166 | 0.028 |
| 1.209999999999912 | 0.406 | 0.067 | 0.011 | 0.165 | 0.027 |
| 1.214999999999912 | 0.404 | 0.066 | 0.011 | 0.163 | 0.027 |
| 1.219999999999912 | 0.402 | 0.065 | 0.01 | 0.161 | 0.026 |
| 1.224999999999911 | 0.4 | 0.064 | 0.01 | 0.16 | 0.026 |
| 1.229999999999911 | 0.398 | 0.063 | 0.01 | 0.158 | 0.025 |
| 1.234999999999911 | 0.396 | 0.062 | 0.01 | 0.157 | 0.025 |
| 1.239999999999911 | 0.394 | 0.061 | 0.01 | 0.155 | 0.024 |
| 1.244999999999911 | 0.392 | 0.06 | 0.009 | 0.154 | 0.024 |
| 1.249999999999911 | 0.39 | 0.059 | 0.009 | 0.152 | 0.023 |
| 1.254999999999911 | 0.388 | 0.059 | 0.009 | 0.151 | 0.023 |
| 1.259999999999911 | 0.386 | 0.058 | 0.009 | 0.149 | 0.022 |
| 1.264999999999911 | 0.385 | 0.057 | 0.008 | 0.148 | 0.022 |
| 1.269999999999911 | 0.383 | 0.056 | 0.008 | 0.146 | 0.021 |
| 1.27499999999991 | 0.381 | 0.055 | 0.008 | 0.145 | 0.021 |
| 1.27999999999991 | 0.379 | 0.054 | 0.008 | 0.144 | 0.021 |
| 1.28499999999991 | 0.377 | 0.054 | 0.008 | 0.142 | 0.02 |
| 1.28999999999991 | 0.375 | 0.053 | 0.007 | 0.141 | 0.02 |
| 1.29499999999991 | 0.374 | 0.052 | 0.007 | 0.14 | 0.019 |
| 1.29999999999991 | 0.372 | 0.051 | 0.007 | 0.138 | 0.019 |
| 1.30499999999991 | 0.37 | 0.051 | 0.007 | 0.137 | 0.019 |
| 1.30999999999991 | 0.368 | 0.05 | 0.007 | 0.136 | 0.018 |
| 1.31499999999991 | 0.366 | 0.049 | 0.007 | 0.134 | 0.018 |
| 1.319999999999909 | 0.365 | 0.048 | 0.006 | 0.133 | 0.018 |
| 1.324999999999909 | 0.363 | 0.048 | 0.006 | 0.132 | 0.017 |
| 1.329999999999909 | 0.361 | 0.047 | 0.006 | 0.13 | 0.017 |
| 1.334999999999909 | 0.359 | 0.046 | 0.006 | 0.129 | 0.017 |
| 1.339999999999909 | 0.358 | 0.046 | 0.006 | 0.128 | 0.016 |
| 1.344999999999909 | 0.356 | 0.045 | 0.006 | 0.127 | 0.016 |
| 1.349999999999909 | 0.354 | 0.044 | 0.006 | 0.126 | 0.016 |
| 1.354999999999909 | 0.353 | 0.044 | 0.005 | 0.124 | 0.015 |
| 1.359999999999909 | 0.351 | 0.043 | 0.005 | 0.123 | 0.015 |
| 1.364999999999908 | 0.349 | 0.043 | 0.005 | 0.122 | 0.015 |
| 1.369999999999908 | 0.348 | 0.042 | 0.005 | 0.121 | 0.015 |
| 1.374999999999908 | 0.346 | 0.041 | 0.005 | 0.12 | 0.014 |
| 1.379999999999908 | 0.344 | 0.041 | 0.005 | 0.119 | 0.014 |
| 1.384999999999908 | 0.343 | 0.04 | 0.005 | 0.117 | 0.014 |
| 1.389999999999908 | 0.341 | 0.04 | 0.005 | 0.116 | 0.014 |
| 1.394999999999908 | 0.339 | 0.039 | 0.005 | 0.115 | 0.013 |
| 1.399999999999908 | 0.338 | 0.039 | 0.004 | 0.114 | 0.013 |
| 1.404999999999908 | 0.336 | 0.038 | 0.004 | 0.113 | 0.013 |
| 1.409999999999908 | 0.335 | 0.037 | 0.004 | 0.112 | 0.013 |
| 1.414999999999907 | 0.333 | 0.037 | 0.004 | 0.111 | 0.012 |
| 1.419999999999907 | 0.332 | 0.036 | 0.004 | 0.11 | 0.012 |
| 1.424999999999907 | 0.33 | 0.036 | 0.004 | 0.109 | 0.012 |
| 1.429999999999907 | 0.328 | 0.035 | 0.004 | 0.108 | 0.012 |
| 1.434999999999907 | 0.327 | 0.035 | 0.004 | 0.107 | 0.011 |
| 1.439999999999907 | 0.325 | 0.034 | 0.004 | 0.106 | 0.011 |
| 1.444999999999907 | 0.324 | 0.034 | 0.004 | 0.105 | 0.011 |
| 1.449999999999907 | 0.322 | 0.033 | 0.003 | 0.104 | 0.011 |
| 1.454999999999907 | 0.321 | 0.033 | 0.003 | 0.103 | 0.011 |
| 1.459999999999906 | 0.319 | 0.033 | 0.003 | 0.102 | 0.01 |
| 1.464999999999906 | 0.318 | 0.032 | 0.003 | 0.101 | 0.01 |
| 1.469999999999906 | 0.316 | 0.032 | 0.003 | 0.1 | 0.01 |
| 1.474999999999906 | 0.315 | 0.031 | 0.003 | 0.099 | 0.01 |
| 1.479999999999906 | 0.313 | 0.031 | 0.003 | 0.098 | 0.01 |
| 1.484999999999906 | 0.312 | 0.03 | 0.003 | 0.097 | 0.009 |
| 1.489999999999906 | 0.311 | 0.03 | 0.003 | 0.096 | 0.009 |
| 1.494999999999906 | 0.309 | 0.03 | 0.003 | 0.096 | 0.009 |
| 1.499999999999906 | 0.308 | 0.029 | 0.003 | 0.095 | 0.009 |
| 1.504999999999906 | 0.306 | 0.029 | 0.003 | 0.094 | 0.009 |
| 1.509999999999905 | 0.305 | 0.028 | 0.003 | 0.093 | 0.009 |
| 1.514999999999905 | 0.303 | 0.028 | 0.003 | 0.092 | 0.008 |
| 1.519999999999905 | 0.302 | 0.028 | 0.003 | 0.091 | 0.008 |
| 1.524999999999905 | 0.301 | 0.027 | 0.002 | 0.09 | 0.008 |
| 1.529999999999905 | 0.299 | 0.027 | 0.002 | 0.09 | 0.008 |
| 1.534999999999905 | 0.298 | 0.026 | 0.002 | 0.089 | 0.008 |
| 1.539999999999905 | 0.297 | 0.026 | 0.002 | 0.088 | 0.008 |
| 1.544999999999905 | 0.295 | 0.026 | 0.002 | 0.087 | 0.008 |
| 1.549999999999905 | 0.294 | 0.025 | 0.002 | 0.086 | 0.007 |
| 1.554999999999904 | 0.293 | 0.025 | 0.002 | 0.086 | 0.007 |
| 1.559999999999904 | 0.291 | 0.025 | 0.002 | 0.085 | 0.007 |
| 1.564999999999904 | 0.29 | 0.024 | 0.002 | 0.084 | 0.007 |
| 1.569999999999904 | 0.289 | 0.024 | 0.002 | 0.083 | 0.007 |
| 1.574999999999904 | 0.287 | 0.024 | 0.002 | 0.083 | 0.007 |
| 1.579999999999904 | 0.286 | 0.023 | 0.002 | 0.082 | 0.007 |
| 1.584999999999904 | 0.285 | 0.023 | 0.002 | 0.081 | 0.007 |
| 1.589999999999904 | 0.283 | 0.023 | 0.002 | 0.08 | 0.006 |
| 1.594999999999904 | 0.282 | 0.022 | 0.002 | 0.08 | 0.006 |
| 1.599999999999903 | 0.281 | 0.022 | 0.002 | 0.079 | 0.006 |
| 1.604999999999903 | 0.28 | 0.022 | 0.002 | 0.078 | 0.006 |
| 1.609999999999903 | 0.278 | 0.022 | 0.002 | 0.078 | 0.006 |
| 1.614999999999903 | 0.277 | 0.021 | 0.002 | 0.077 | 0.006 |
| 1.619999999999903 | 0.276 | 0.021 | 0.002 | 0.076 | 0.006 |
| 1.624999999999903 | 0.275 | 0.021 | 0.002 | 0.075 | 0.006 |
| 1.629999999999903 | 0.273 | 0.02 | 0.002 | 0.075 | 0.006 |
| 1.634999999999903 | 0.272 | 0.02 | 0.001 | 0.074 | 0.005 |
| 1.639999999999903 | 0.271 | 0.02 | 0.001 | 0.073 | 0.005 |
| 1.644999999999902 | 0.27 | 0.02 | 0.001 | 0.073 | 0.005 |
| 1.649999999999902 | 0.269 | 0.019 | 0.001 | 0.072 | 0.005 |
| 1.654999999999902 | 0.267 | 0.019 | 0.001 | 0.072 | 0.005 |
| 1.659999999999902 | 0.266 | 0.019 | 0.001 | 0.071 | 0.005 |
| 1.664999999999902 | 0.265 | 0.019 | 0.001 | 0.07 | 0.005 |
| 1.669999999999902 | 0.264 | 0.018 | 0.001 | 0.07 | 0.005 |
| 1.674999999999902 | 0.263 | 0.018 | 0.001 | 0.069 | 0.005 |
| 1.679999999999902 | 0.262 | 0.018 | 0.001 | 0.068 | 0.005 |
| 1.684999999999902 | 0.26 | 0.018 | 0.001 | 0.068 | 0.005 |
| 1.689999999999901 | 0.259 | 0.017 | 0.001 | 0.067 | 0.005 |
| 1.694999999999901 | 0.258 | 0.017 | 0.001 | 0.067 | 0.004 |
| 1.699999999999901 | 0.257 | 0.017 | 0.001 | 0.066 | 0.004 |
| 1.704999999999901 | 0.256 | 0.017 | 0.001 | 0.066 | 0.004 |
| 1.709999999999901 | 0.255 | 0.017 | 0.001 | 0.065 | 0.004 |
| 1.714999999999901 | 0.254 | 0.016 | 0.001 | 0.064 | 0.004 |
| 1.719999999999901 | 0.253 | 0.016 | 0.001 | 0.064 | 0.004 |
| 1.724999999999901 | 0.252 | 0.016 | 0.001 | 0.063 | 0.004 |
| 1.729999999999901 | 0.25 | 0.016 | 0.001 | 0.063 | 0.004 |
| 1.734999999999901 | 0.249 | 0.016 | 0.001 | 0.062 | 0.004 |
| 1.7399999999999 | 0.248 | 0.015 | 0.001 | 0.062 | 0.004 |
| 1.7449999999999 | 0.247 | 0.015 | 0.001 | 0.061 | 0.004 |
| 1.7499999999999 | 0.246 | 0.015 | 0.001 | 0.061 | 0.004 |
| 1.7549999999999 | 0.245 | 0.015 | 0.001 | 0.06 | 0.004 |
| 1.7599999999999 | 0.244 | 0.015 | 0.001 | 0.06 | 0.004 |
| 1.7649999999999 | 0.243 | 0.014 | 0.001 | 0.059 | 0.003 |
| 1.7699999999999 | 0.242 | 0.014 | 0.001 | 0.059 | 0.003 |
| 1.7749999999999 | 0.241 | 0.014 | 0.001 | 0.058 | 0.003 |
| 1.7799999999999 | 0.24 | 0.014 | 0.001 | 0.058 | 0.003 |
| 1.784999999999899 | 0.239 | 0.014 | 0.001 | 0.057 | 0.003 |
| 1.789999999999899 | 0.238 | 0.013 | 0.001 | 0.057 | 0.003 |
| 1.794999999999899 | 0.237 | 0.013 | 0.001 | 0.056 | 0.003 |
| 1.799999999999899 | 0.236 | 0.013 | 0.001 | 0.056 | 0.003 |
| 1.804999999999899 | 0.235 | 0.013 | 0.001 | 0.055 | 0.003 |
| 1.809999999999899 | 0.234 | 0.013 | 0.001 | 0.055 | 0.003 |
| 1.814999999999899 | 0.233 | 0.013 | 0.001 | 0.054 | 0.003 |
| 1.819999999999899 | 0.232 | 0.012 | 0.001 | 0.054 | 0.003 |
| 1.824999999999899 | 0.231 | 0.012 | 0.001 | 0.053 | 0.003 |
| 1.829999999999899 | 0.23 | 0.012 | 0.001 | 0.053 | 0.003 |
| 1.834999999999898 | 0.229 | 0.012 | 0.001 | 0.052 | 0.003 |
| 1.839999999999898 | 0.228 | 0.012 | 0.001 | 0.052 | 0.003 |
| 1.844999999999898 | 0.227 | 0.012 | 0.001 | 0.052 | 0.003 |
| 1.849999999999898 | 0.226 | 0.012 | 0.001 | 0.051 | 0.003 |
| 1.854999999999898 | 0.225 | 0.011 | 0.001 | 0.051 | 0.003 |
| 1.859999999999898 | 0.224 | 0.011 | 0.001 | 0.05 | 0.003 |
| 1.864999999999898 | 0.223 | 0.011 | 0.001 | 0.05 | 0.002 |
| 1.869999999999898 | 0.222 | 0.011 | 0.001 | 0.049 | 0.002 |
| 1.874999999999898 | 0.221 | 0.011 | 0.001 | 0.049 | 0.002 |
| 1.879999999999897 | 0.221 | 0.011 | 0.001 | 0.049 | 0.002 |
| 1.884999999999897 | 0.22 | 0.011 | 0.001 | 0.048 | 0.002 |
| 1.889999999999897 | 0.219 | 0.01 | 0.001 | 0.048 | 0.002 |
| 1.894999999999897 | 0.218 | 0.01 | 0 | 0.047 | 0.002 |
| 1.899999999999897 | 0.217 | 0.01 | 0 | 0.047 | 0.002 |
| 1.904999999999897 | 0.216 | 0.01 | 0 | 0.047 | 0.002 |
| 1.909999999999897 | 0.215 | 0.01 | 0 | 0.046 | 0.002 |
| 1.914999999999897 | 0.214 | 0.01 | 0 | 0.046 | 0.002 |
| 1.919999999999897 | 0.213 | 0.01 | 0 | 0.046 | 0.002 |
| 1.924999999999897 | 0.213 | 0.01 | 0 | 0.045 | 0.002 |
| 1.929999999999896 | 0.212 | 0.009 | 0 | 0.045 | 0.002 |
| 1.934999999999896 | 0.211 | 0.009 | 0 | 0.044 | 0.002 |
| 1.939999999999896 | 0.21 | 0.009 | 0 | 0.044 | 0.002 |
| 1.944999999999896 | 0.209 | 0.009 | 0 | 0.044 | 0.002 |
| 1.949999999999896 | 0.208 | 0.009 | 0 | 0.043 | 0.002 |
| 1.954999999999896 | 0.207 | 0.009 | 0 | 0.043 | 0.002 |
| 1.959999999999896 | 0.207 | 0.009 | 0 | 0.043 | 0.002 |
| 1.964999999999896 | 0.206 | 0.009 | 0 | 0.042 | 0.002 |
| 1.969999999999896 | 0.205 | 0.009 | 0 | 0.042 | 0.002 |
| 1.974999999999895 | 0.204 | 0.008 | 0 | 0.042 | 0.002 |
| 1.979999999999895 | 0.203 | 0.008 | 0 | 0.041 | 0.002 |
| 1.984999999999895 | 0.202 | 0.008 | 0 | 0.041 | 0.002 |
| 1.989999999999895 | 0.202 | 0.008 | 0 | 0.041 | 0.002 |
| 1.994999999999895 | 0.201 | 0.008 | 0 | 0.04 | 0.002 |
| 1.999999999999895 | 0.2 | 0.008 | 0 | 0.04 | 0.002 |
| 2.004999999999895 | 0.199 | 0.008 | 0 | 0.04 | 0.002 |
| 2.009999999999895 | 0.198 | 0.008 | 0 | 0.039 | 0.002 |
| 2.014999999999895 | 0.198 | 0.008 | 0 | 0.039 | 0.002 |
| 2.019999999999895 | 0.197 | 0.008 | 0 | 0.039 | 0.002 |
| 2.024999999999895 | 0.196 | 0.008 | 0 | 0.038 | 0.001 |
| 2.029999999999895 | 0.195 | 0.007 | 0 | 0.038 | 0.001 |
| 2.034999999999894 | 0.195 | 0.007 | 0 | 0.038 | 0.001 |
| 2.039999999999894 | 0.194 | 0.007 | 0 | 0.038 | 0.001 |
| 2.044999999999894 | 0.193 | 0.007 | 0 | 0.037 | 0.001 |
| 2.049999999999894 | 0.192 | 0.007 | 0 | 0.037 | 0.001 |
| 2.054999999999894 | 0.191 | 0.007 | 0 | 0.037 | 0.001 |
| 2.059999999999894 | 0.191 | 0.007 | 0 | 0.036 | 0.001 |
| 2.064999999999894 | 0.19 | 0.007 | 0 | 0.036 | 0.001 |
| 2.069999999999894 | 0.189 | 0.007 | 0 | 0.036 | 0.001 |
| 2.074999999999894 | 0.188 | 0.007 | 0 | 0.036 | 0.001 |
| 2.079999999999893 | 0.188 | 0.007 | 0 | 0.035 | 0.001 |
| 2.084999999999893 | 0.187 | 0.007 | 0 | 0.035 | 0.001 |
| 2.089999999999893 | 0.186 | 0.006 | 0 | 0.035 | 0.001 |
| 2.094999999999893 | 0.186 | 0.006 | 0 | 0.034 | 0.001 |
| 2.099999999999893 | 0.185 | 0.006 | 0 | 0.034 | 0.001 |
| 2.104999999999893 | 0.184 | 0.006 | 0 | 0.034 | 0.001 |
| 2.109999999999893 | 0.183 | 0.006 | 0 | 0.034 | 0.001 |
| 2.114999999999893 | 0.183 | 0.006 | 0 | 0.033 | 0.001 |
| 2.119999999999893 | 0.182 | 0.006 | 0 | 0.033 | 0.001 |
| 2.124999999999893 | 0.181 | 0.006 | 0 | 0.033 | 0.001 |
| 2.129999999999892 | 0.181 | 0.006 | 0 | 0.033 | 0.001 |
| 2.134999999999892 | 0.18 | 0.006 | 0 | 0.032 | 0.001 |
| 2.139999999999892 | 0.179 | 0.006 | 0 | 0.032 | 0.001 |
| 2.144999999999892 | 0.179 | 0.006 | 0 | 0.032 | 0.001 |
| 2.149999999999892 | 0.178 | 0.006 | 0 | 0.032 | 0.001 |
| 2.154999999999892 | 0.177 | 0.006 | 0 | 0.031 | 0.001 |
| 2.159999999999892 | 0.177 | 0.005 | 0 | 0.031 | 0.001 |
| 2.164999999999892 | 0.176 | 0.005 | 0 | 0.031 | 0.001 |
| 2.169999999999892 | 0.175 | 0.005 | 0 | 0.031 | 0.001 |
| 2.174999999999891 | 0.175 | 0.005 | 0 | 0.03 | 0.001 |
| 2.179999999999891 | 0.174 | 0.005 | 0 | 0.03 | 0.001 |
| 2.184999999999891 | 0.173 | 0.005 | 0 | 0.03 | 0.001 |
| 2.189999999999891 | 0.173 | 0.005 | 0 | 0.03 | 0.001 |
| 2.194999999999891 | 0.172 | 0.005 | 0 | 0.03 | 0.001 |
| 2.199999999999891 | 0.171 | 0.005 | 0 | 0.029 | 0.001 |
| 2.204999999999891 | 0.171 | 0.005 | 0 | 0.029 | 0.001 |
| 2.209999999999891 | 0.17 | 0.005 | 0 | 0.029 | 0.001 |
| 2.214999999999891 | 0.169 | 0.005 | 0 | 0.029 | 0.001 |
| 2.21999999999989 | 0.169 | 0.005 | 0 | 0.028 | 0.001 |
| 2.22499999999989 | 0.168 | 0.005 | 0 | 0.028 | 0.001 |
| 2.22999999999989 | 0.167 | 0.005 | 0 | 0.028 | 0.001 |
| 2.23499999999989 | 0.167 | 0.005 | 0 | 0.028 | 0.001 |
| 2.23999999999989 | 0.166 | 0.005 | 0 | 0.028 | 0.001 |
| 2.24499999999989 | 0.166 | 0.005 | 0 | 0.027 | 0.001 |
| 2.24999999999989 | 0.165 | 0.004 | 0 | 0.027 | 0.001 |
| 2.25499999999989 | 0.164 | 0.004 | 0 | 0.027 | 0.001 |
| 2.25999999999989 | 0.164 | 0.004 | 0 | 0.027 | 0.001 |
| 2.26499999999989 | 0.163 | 0.004 | 0 | 0.027 | 0.001 |
| 2.269999999999889 | 0.163 | 0.004 | 0 | 0.026 | 0.001 |
| 2.274999999999889 | 0.162 | 0.004 | 0 | 0.026 | 0.001 |
| 2.279999999999889 | 0.161 | 0.004 | 0 | 0.026 | 0.001 |
| 2.284999999999889 | 0.161 | 0.004 | 0 | 0.026 | 0.001 |
| 2.289999999999889 | 0.16 | 0.004 | 0 | 0.026 | 0.001 |
| 2.294999999999889 | 0.16 | 0.004 | 0 | 0.025 | 0.001 |
| 2.299999999999889 | 0.159 | 0.004 | 0 | 0.025 | 0.001 |
| 2.304999999999889 | 0.158 | 0.004 | 0 | 0.025 | 0.001 |
| 2.309999999999889 | 0.158 | 0.004 | 0 | 0.025 | 0.001 |
| 2.314999999999888 | 0.157 | 0.004 | 0 | 0.025 | 0.001 |
| 2.319999999999888 | 0.157 | 0.004 | 0 | 0.025 | 0.001 |
| 2.324999999999888 | 0.156 | 0.004 | 0 | 0.024 | 0.001 |
| 2.329999999999888 | 0.156 | 0.004 | 0 | 0.024 | 0.001 |
| 2.334999999999888 | 0.155 | 0.004 | 0 | 0.024 | 0.001 |
| 2.339999999999888 | 0.154 | 0.004 | 0 | 0.024 | 0.001 |
| 2.344999999999888 | 0.154 | 0.004 | 0 | 0.024 | 0.001 |
| 2.349999999999888 | 0.153 | 0.004 | 0 | 0.024 | 0.001 |
| 2.354999999999888 | 0.153 | 0.004 | 0 | 0.023 | 0.001 |
| 2.359999999999887 | 0.152 | 0.004 | 0 | 0.023 | 0.001 |
| 2.364999999999887 | 0.152 | 0.003 | 0 | 0.023 | 0.001 |
| 2.369999999999887 | 0.151 | 0.003 | 0 | 0.023 | 0.001 |
| 2.374999999999887 | 0.151 | 0.003 | 0 | 0.023 | 0.001 |
| 2.379999999999887 | 0.15 | 0.003 | 0 | 0.023 | 0.001 |
| 2.384999999999887 | 0.15 | 0.003 | 0 | 0.022 | 0 |
| 2.389999999999887 | 0.149 | 0.003 | 0 | 0.022 | 0 |
| 2.394999999999887 | 0.148 | 0.003 | 0 | 0.022 | 0 |
| 2.399999999999887 | 0.148 | 0.003 | 0 | 0.022 | 0 |
| 2.404999999999887 | 0.147 | 0.003 | 0 | 0.022 | 0 |
| 2.409999999999886 | 0.147 | 0.003 | 0 | 0.022 | 0 |
| 2.414999999999886 | 0.146 | 0.003 | 0 | 0.021 | 0 |
| 2.419999999999886 | 0.146 | 0.003 | 0 | 0.021 | 0 |
| 2.424999999999886 | 0.145 | 0.003 | 0 | 0.021 | 0 |
| 2.429999999999886 | 0.145 | 0.003 | 0 | 0.021 | 0 |
| 2.434999999999886 | 0.144 | 0.003 | 0 | 0.021 | 0 |
| 2.439999999999886 | 0.144 | 0.003 | 0 | 0.021 | 0 |
| 2.444999999999886 | 0.143 | 0.003 | 0 | 0.021 | 0 |
| 2.449999999999886 | 0.143 | 0.003 | 0 | 0.02 | 0 |
| 2.454999999999885 | 0.142 | 0.003 | 0 | 0.02 | 0 |
| 2.459999999999885 | 0.142 | 0.003 | 0 | 0.02 | 0 |
| 2.464999999999885 | 0.141 | 0.003 | 0 | 0.02 | 0 |
| 2.469999999999885 | 0.141 | 0.003 | 0 | 0.02 | 0 |
| 2.474999999999885 | 0.14 | 0.003 | 0 | 0.02 | 0 |
| 2.479999999999885 | 0.14 | 0.003 | 0 | 0.02 | 0 |
| 2.484999999999885 | 0.139 | 0.003 | 0 | 0.019 | 0 |
| 2.489999999999885 | 0.139 | 0.003 | 0 | 0.019 | 0 |
| 2.494999999999885 | 0.138 | 0.003 | 0 | 0.019 | 0 |
| 2.499999999999884 | 0.138 | 0.003 | 0 | 0.019 | 0 |
| 2.504999999999884 | 0.137 | 0.003 | 0 | 0.019 | 0 |
| 2.509999999999884 | 0.137 | 0.003 | 0 | 0.019 | 0 |
| 2.514999999999884 | 0.137 | 0.003 | 0 | 0.019 | 0 |
| 2.519999999999884 | 0.136 | 0.003 | 0 | 0.019 | 0 |
| 2.524999999999884 | 0.136 | 0.002 | 0 | 0.018 | 0 |
| 2.529999999999884 | 0.135 | 0.002 | 0 | 0.018 | 0 |
| 2.534999999999884 | 0.135 | 0.002 | 0 | 0.018 | 0 |
| 2.539999999999884 | 0.134 | 0.002 | 0 | 0.018 | 0 |
| 2.544999999999884 | 0.134 | 0.002 | 0 | 0.018 | 0 |
| 2.549999999999883 | 0.133 | 0.002 | 0 | 0.018 | 0 |
| 2.554999999999883 | 0.133 | 0.002 | 0 | 0.018 | 0 |
| 2.559999999999883 | 0.132 | 0.002 | 0 | 0.018 | 0 |
| 2.564999999999883 | 0.132 | 0.002 | 0 | 0.017 | 0 |
| 2.569999999999883 | 0.131 | 0.002 | 0 | 0.017 | 0 |
| 2.574999999999883 | 0.131 | 0.002 | 0 | 0.017 | 0 |
| 2.579999999999883 | 0.131 | 0.002 | 0 | 0.017 | 0 |
| 2.584999999999883 | 0.13 | 0.002 | 0 | 0.017 | 0 |
| 2.589999999999883 | 0.13 | 0.002 | 0 | 0.017 | 0 |
| 2.594999999999882 | 0.129 | 0.002 | 0 | 0.017 | 0 |
| 2.599999999999882 | 0.129 | 0.002 | 0 | 0.017 | 0 |
| 2.604999999999882 | 0.128 | 0.002 | 0 | 0.016 | 0 |
| 2.609999999999882 | 0.128 | 0.002 | 0 | 0.016 | 0 |
| 2.614999999999882 | 0.128 | 0.002 | 0 | 0.016 | 0 |
| 2.619999999999882 | 0.127 | 0.002 | 0 | 0.016 | 0 |
| 2.624999999999882 | 0.127 | 0.002 | 0 | 0.016 | 0 |
| 2.629999999999882 | 0.126 | 0.002 | 0 | 0.016 | 0 |
| 2.634999999999882 | 0.126 | 0.002 | 0 | 0.016 | 0 |
| 2.639999999999881 | 0.125 | 0.002 | 0 | 0.016 | 0 |
| 2.644999999999881 | 0.125 | 0.002 | 0 | 0.016 | 0 |
| 2.649999999999881 | 0.125 | 0.002 | 0 | 0.016 | 0 |
| 2.654999999999881 | 0.124 | 0.002 | 0 | 0.015 | 0 |
| 2.659999999999881 | 0.124 | 0.002 | 0 | 0.015 | 0 |
| 2.664999999999881 | 0.123 | 0.002 | 0 | 0.015 | 0 |
| 2.669999999999881 | 0.123 | 0.002 | 0 | 0.015 | 0 |
| 2.674999999999881 | 0.123 | 0.002 | 0 | 0.015 | 0 |
| 2.679999999999881 | 0.122 | 0.002 | 0 | 0.015 | 0 |
| 2.68499999999988 | 0.122 | 0.002 | 0 | 0.015 | 0 |
| 2.68999999999988 | 0.121 | 0.002 | 0 | 0.015 | 0 |
| 2.69499999999988 | 0.121 | 0.002 | 0 | 0.015 | 0 |
| 2.69999999999988 | 0.121 | 0.002 | 0 | 0.015 | 0 |
| 2.70499999999988 | 0.12 | 0.002 | 0 | 0.014 | 0 |
| 2.70999999999988 | 0.12 | 0.002 | 0 | 0.014 | 0 |
| 2.71499999999988 | 0.119 | 0.002 | 0 | 0.014 | 0 |
| 2.71999999999988 | 0.119 | 0.002 | 0 | 0.014 | 0 |
| 2.72499999999988 | 0.119 | 0.002 | 0 | 0.014 | 0 |
| 2.72999999999988 | 0.118 | 0.002 | 0 | 0.014 | 0 |
| 2.734999999999879 | 0.118 | 0.002 | 0 | 0.014 | 0 |
| 2.739999999999879 | 0.118 | 0.002 | 0 | 0.014 | 0 |
| 2.744999999999879 | 0.117 | 0.002 | 0 | 0.014 | 0 |
| 2.749999999999879 | 0.117 | 0.002 | 0 | 0.014 | 0 |
| 2.754999999999879 | 0.116 | 0.002 | 0 | 0.014 | 0 |
| 2.759999999999879 | 0.116 | 0.002 | 0 | 0.013 | 0 |
| 2.764999999999879 | 0.116 | 0.002 | 0 | 0.013 | 0 |
| 2.769999999999879 | 0.115 | 0.002 | 0 | 0.013 | 0 |
| 2.774999999999879 | 0.115 | 0.002 | 0 | 0.013 | 0 |
| 2.779999999999878 | 0.115 | 0.002 | 0 | 0.013 | 0 |
| 2.784999999999878 | 0.114 | 0.001 | 0 | 0.013 | 0 |
| 2.789999999999878 | 0.114 | 0.001 | 0 | 0.013 | 0 |
| 2.794999999999878 | 0.113 | 0.001 | 0 | 0.013 | 0 |
| 2.799999999999878 | 0.113 | 0.001 | 0 | 0.013 | 0 |
| 2.804999999999878 | 0.113 | 0.001 | 0 | 0.013 | 0 |
| 2.809999999999878 | 0.112 | 0.001 | 0 | 0.013 | 0 |
| 2.814999999999878 | 0.112 | 0.001 | 0 | 0.013 | 0 |
| 2.819999999999878 | 0.112 | 0.001 | 0 | 0.012 | 0 |
| 2.824999999999878 | 0.111 | 0.001 | 0 | 0.012 | 0 |
| 2.829999999999877 | 0.111 | 0.001 | 0 | 0.012 | 0 |
| 2.834999999999877 | 0.111 | 0.001 | 0 | 0.012 | 0 |
| 2.839999999999877 | 0.11 | 0.001 | 0 | 0.012 | 0 |
| 2.844999999999877 | 0.11 | 0.001 | 0 | 0.012 | 0 |
| 2.849999999999877 | 0.11 | 0.001 | 0 | 0.012 | 0 |
| 2.854999999999877 | 0.109 | 0.001 | 0 | 0.012 | 0 |
| 2.859999999999877 | 0.109 | 0.001 | 0 | 0.012 | 0 |
| 2.864999999999877 | 0.109 | 0.001 | 0 | 0.012 | 0 |
| 2.869999999999877 | 0.108 | 0.001 | 0 | 0.012 | 0 |
| 2.874999999999876 | 0.108 | 0.001 | 0 | 0.012 | 0 |
| 2.879999999999876 | 0.108 | 0.001 | 0 | 0.012 | 0 |
| 2.884999999999876 | 0.107 | 0.001 | 0 | 0.012 | 0 |
| 2.889999999999876 | 0.107 | 0.001 | 0 | 0.011 | 0 |
| 2.894999999999876 | 0.107 | 0.001 | 0 | 0.011 | 0 |
| 2.899999999999876 | 0.106 | 0.001 | 0 | 0.011 | 0 |
| 2.904999999999876 | 0.106 | 0.001 | 0 | 0.011 | 0 |
| 2.909999999999876 | 0.106 | 0.001 | 0 | 0.011 | 0 |
| 2.914999999999876 | 0.105 | 0.001 | 0 | 0.011 | 0 |
| 2.919999999999876 | 0.105 | 0.001 | 0 | 0.011 | 0 |
| 2.924999999999875 | 0.105 | 0.001 | 0 | 0.011 | 0 |
| 2.929999999999875 | 0.104 | 0.001 | 0 | 0.011 | 0 |
| 2.934999999999875 | 0.104 | 0.001 | 0 | 0.011 | 0 |
| 2.939999999999875 | 0.104 | 0.001 | 0 | 0.011 | 0 |
| 2.944999999999875 | 0.103 | 0.001 | 0 | 0.011 | 0 |
| 2.949999999999875 | 0.103 | 0.001 | 0 | 0.011 | 0 |
| 2.954999999999875 | 0.103 | 0.001 | 0 | 0.011 | 0 |
| 2.959999999999875 | 0.102 | 0.001 | 0 | 0.01 | 0 |
| 2.964999999999875 | 0.102 | 0.001 | 0 | 0.01 | 0 |
| 2.969999999999874 | 0.102 | 0.001 | 0 | 0.01 | 0 |
| 2.974999999999874 | 0.102 | 0.001 | 0 | 0.01 | 0 |
| 2.979999999999874 | 0.101 | 0.001 | 0 | 0.01 | 0 |
| 2.984999999999874 | 0.101 | 0.001 | 0 | 0.01 | 0 |
| 2.989999999999874 | 0.101 | 0.001 | 0 | 0.01 | 0 |
| 2.994999999999874 | 0.1 | 0.001 | 0 | 0.01 | 0 |
| 2.999999999999874 | 0.1 | 0.001 | 0 | 0.01 | 0 |
| 3.004999999999874 | 0.1 | 0.001 | 0 | 0.01 | 0 |
| 3.009999999999874 | 0.099 | 0.001 | 0 | 0.01 | 0 |
| 3.014999999999874 | 0.099 | 0.001 | 0 | 0.01 | 0 |
| 3.019999999999873 | 0.099 | 0.001 | 0 | 0.01 | 0 |
| 3.024999999999873 | 0.099 | 0.001 | 0 | 0.01 | 0 |
| 3.029999999999873 | 0.098 | 0.001 | 0 | 0.01 | 0 |
| 3.034999999999873 | 0.098 | 0.001 | 0 | 0.01 | 0 |
| 3.039999999999873 | 0.098 | 0.001 | 0 | 0.01 | 0 |
| 3.044999999999873 | 0.097 | 0.001 | 0 | 0.009 | 0 |
| 3.049999999999873 | 0.097 | 0.001 | 0 | 0.009 | 0 |
| 3.054999999999873 | 0.097 | 0.001 | 0 | 0.009 | 0 |
| 3.059999999999873 | 0.096 | 0.001 | 0 | 0.009 | 0 |
| 3.064999999999872 | 0.096 | 0.001 | 0 | 0.009 | 0 |
| 3.069999999999872 | 0.096 | 0.001 | 0 | 0.009 | 0 |
| 3.074999999999872 | 0.096 | 0.001 | 0 | 0.009 | 0 |
| 3.079999999999872 | 0.095 | 0.001 | 0 | 0.009 | 0 |
| 3.084999999999872 | 0.095 | 0.001 | 0 | 0.009 | 0 |
| 3.089999999999872 | 0.095 | 0.001 | 0 | 0.009 | 0 |
| 3.094999999999872 | 0.095 | 0.001 | 0 | 0.009 | 0 |
| 3.099999999999872 | 0.094 | 0.001 | 0 | 0.009 | 0 |
| 3.104999999999872 | 0.094 | 0.001 | 0 | 0.009 | 0 |
| 3.109999999999872 | 0.094 | 0.001 | 0 | 0.009 | 0 |
| 3.114999999999871 | 0.093 | 0.001 | 0 | 0.009 | 0 |
| 3.119999999999871 | 0.093 | 0.001 | 0 | 0.009 | 0 |
| 3.124999999999871 | 0.093 | 0.001 | 0 | 0.009 | 0 |
| 3.129999999999871 | 0.093 | 0.001 | 0 | 0.009 | 0 |
| 3.134999999999871 | 0.092 | 0.001 | 0 | 0.009 | 0 |
| 3.139999999999871 | 0.092 | 0.001 | 0 | 0.008 | 0 |
| 3.144999999999871 | 0.092 | 0.001 | 0 | 0.008 | 0 |
| 3.149999999999871 | 0.092 | 0.001 | 0 | 0.008 | 0 |
| 3.154999999999871 | 0.091 | 0.001 | 0 | 0.008 | 0 |
| 3.15999999999987 | 0.091 | 0.001 | 0 | 0.008 | 0 |
| 3.16499999999987 | 0.091 | 0.001 | 0 | 0.008 | 0 |
| 3.16999999999987 | 0.091 | 0.001 | 0 | 0.008 | 0 |
| 3.17499999999987 | 0.09 | 0.001 | 0 | 0.008 | 0 |
| 3.17999999999987 | 0.09 | 0.001 | 0 | 0.008 | 0 |
| 3.18499999999987 | 0.09 | 0.001 | 0 | 0.008 | 0 |
| 3.18999999999987 | 0.089 | 0.001 | 0 | 0.008 | 0 |
| 3.19499999999987 | 0.089 | 0.001 | 0 | 0.008 | 0 |
| 3.19999999999987 | 0.089 | 0.001 | 0 | 0.008 | 0 |
| 3.204999999999869 | 0.089 | 0.001 | 0 | 0.008 | 0 |
| 3.209999999999869 | 0.088 | 0.001 | 0 | 0.008 | 0 |
| 3.214999999999869 | 0.088 | 0.001 | 0 | 0.008 | 0 |
| 3.219999999999869 | 0.088 | 0.001 | 0 | 0.008 | 0 |
| 3.224999999999869 | 0.088 | 0.001 | 0 | 0.008 | 0 |
| 3.229999999999869 | 0.087 | 0.001 | 0 | 0.008 | 0 |
| 3.234999999999869 | 0.087 | 0.001 | 0 | 0.008 | 0 |
| 3.239999999999869 | 0.087 | 0.001 | 0 | 0.008 | 0 |
| 3.244999999999869 | 0.087 | 0.001 | 0 | 0.008 | 0 |
| 3.249999999999869 | 0.086 | 0.001 | 0 | 0.007 | 0 |
| 3.254999999999868 | 0.086 | 0.001 | 0 | 0.007 | 0 |
| 3.259999999999868 | 0.086 | 0.001 | 0 | 0.007 | 0 |
| 3.264999999999868 | 0.086 | 0.001 | 0 | 0.007 | 0 |
| 3.269999999999868 | 0.086 | 0.001 | 0 | 0.007 | 0 |
| 3.274999999999868 | 0.085 | 0.001 | 0 | 0.007 | 0 |
| 3.279999999999868 | 0.085 | 0.001 | 0 | 0.007 | 0 |
| 3.284999999999868 | 0.085 | 0.001 | 0 | 0.007 | 0 |
| 3.289999999999868 | 0.085 | 0.001 | 0 | 0.007 | 0 |
| 3.294999999999868 | 0.084 | 0.001 | 0 | 0.007 | 0 |
| 3.299999999999867 | 0.084 | 0.001 | 0 | 0.007 | 0 |
| 3.304999999999867 | 0.084 | 0.001 | 0 | 0.007 | 0 |
| 3.309999999999867 | 0.084 | 0.001 | 0 | 0.007 | 0 |
| 3.314999999999867 | 0.083 | 0.001 | 0 | 0.007 | 0 |
| 3.319999999999867 | 0.083 | 0.001 | 0 | 0.007 | 0 |
| 3.324999999999867 | 0.083 | 0.001 | 0 | 0.007 | 0 |
| 3.329999999999867 | 0.083 | 0.001 | 0 | 0.007 | 0 |
| 3.334999999999867 | 0.082 | 0.001 | 0 | 0.007 | 0 |
| 3.339999999999867 | 0.082 | 0.001 | 0 | 0.007 | 0 |
| 3.344999999999866 | 0.082 | 0.001 | 0 | 0.007 | 0 |
| 3.349999999999866 | 0.082 | 0.001 | 0 | 0.007 | 0 |
| 3.354999999999866 | 0.082 | 0.001 | 0 | 0.007 | 0 |
| 3.359999999999866 | 0.081 | 0.001 | 0 | 0.007 | 0 |
| 3.364999999999866 | 0.081 | 0.001 | 0 | 0.007 | 0 |
| 3.369999999999866 | 0.081 | 0.001 | 0 | 0.007 | 0 |
| 3.374999999999866 | 0.081 | 0.001 | 0 | 0.007 | 0 |
| 3.379999999999866 | 0.08 | 0.001 | 0 | 0.006 | 0 |
| 3.384999999999866 | 0.08 | 0.001 | 0 | 0.006 | 0 |
| 3.389999999999866 | 0.08 | 0.001 | 0 | 0.006 | 0 |
| 3.394999999999865 | 0.08 | 0.001 | 0 | 0.006 | 0 |
| 3.399999999999865 | 0.08 | 0.001 | 0 | 0.006 | 0 |
| 3.404999999999865 | 0.079 | 0.001 | 0 | 0.006 | 0 |
| 3.409999999999865 | 0.079 | 0 | 0 | 0.006 | 0 |
| 3.414999999999865 | 0.079 | 0 | 0 | 0.006 | 0 |
| 3.419999999999865 | 0.079 | 0 | 0 | 0.006 | 0 |
| 3.424999999999865 | 0.079 | 0 | 0 | 0.006 | 0 |
| 3.429999999999865 | 0.078 | 0 | 0 | 0.006 | 0 |
| 3.434999999999865 | 0.078 | 0 | 0 | 0.006 | 0 |
| 3.439999999999864 | 0.078 | 0 | 0 | 0.006 | 0 |
| 3.444999999999864 | 0.078 | 0 | 0 | 0.006 | 0 |
| 3.449999999999864 | 0.078 | 0 | 0 | 0.006 | 0 |
| 3.454999999999864 | 0.077 | 0 | 0 | 0.006 | 0 |
| 3.459999999999864 | 0.077 | 0 | 0 | 0.006 | 0 |
| 3.464999999999864 | 0.077 | 0 | 0 | 0.006 | 0 |
| 3.469999999999864 | 0.077 | 0 | 0 | 0.006 | 0 |
| 3.474999999999864 | 0.076 | 0 | 0 | 0.006 | 0 |
| 3.479999999999864 | 0.076 | 0 | 0 | 0.006 | 0 |
| 3.484999999999864 | 0.076 | 0 | 0 | 0.006 | 0 |
| 3.489999999999863 | 0.076 | 0 | 0 | 0.006 | 0 |
| 3.494999999999863 | 0.076 | 0 | 0 | 0.006 | 0 |
| 3.499999999999863 | 0.075 | 0 | 0 | 0.006 | 0 |
| 3.504999999999863 | 0.075 | 0 | 0 | 0.006 | 0 |
| 3.509999999999863 | 0.075 | 0 | 0 | 0.006 | 0 |
| 3.514999999999863 | 0.075 | 0 | 0 | 0.006 | 0 |
| 3.519999999999863 | 0.075 | 0 | 0 | 0.006 | 0 |
| 3.524999999999863 | 0.074 | 0 | 0 | 0.006 | 0 |
| 3.529999999999863 | 0.074 | 0 | 0 | 0.006 | 0 |
| 3.534999999999862 | 0.074 | 0 | 0 | 0.005 | 0 |
| 3.539999999999862 | 0.074 | 0 | 0 | 0.005 | 0 |
| 3.544999999999862 | 0.074 | 0 | 0 | 0.005 | 0 |
| 3.549999999999862 | 0.074 | 0 | 0 | 0.005 | 0 |
| 3.554999999999862 | 0.073 | 0 | 0 | 0.005 | 0 |
| 3.559999999999862 | 0.073 | 0 | 0 | 0.005 | 0 |
| 3.564999999999862 | 0.073 | 0 | 0 | 0.005 | 0 |
| 3.569999999999862 | 0.073 | 0 | 0 | 0.005 | 0 |
| 3.574999999999862 | 0.073 | 0 | 0 | 0.005 | 0 |
| 3.579999999999862 | 0.072 | 0 | 0 | 0.005 | 0 |
| 3.584999999999861 | 0.072 | 0 | 0 | 0.005 | 0 |
| 3.589999999999861 | 0.072 | 0 | 0 | 0.005 | 0 |
| 3.594999999999861 | 0.072 | 0 | 0 | 0.005 | 0 |
| 3.599999999999861 | 0.072 | 0 | 0 | 0.005 | 0 |
| 3.604999999999861 | 0.071 | 0 | 0 | 0.005 | 0 |
| 3.609999999999861 | 0.071 | 0 | 0 | 0.005 | 0 |
| 3.614999999999861 | 0.071 | 0 | 0 | 0.005 | 0 |
| 3.619999999999861 | 0.071 | 0 | 0 | 0.005 | 0 |
| 3.62499999999986 | 0.071 | 0 | 0 | 0.005 | 0 |
| 3.62999999999986 | 0.071 | 0 | 0 | 0.005 | 0 |
| 3.63499999999986 | 0.07 | 0 | 0 | 0.005 | 0 |
| 3.63999999999986 | 0.07 | 0 | 0 | 0.005 | 0 |
| 3.64499999999986 | 0.07 | 0 | 0 | 0.005 | 0 |
| 3.64999999999986 | 0.07 | 0 | 0 | 0.005 | 0 |
| 3.65499999999986 | 0.07 | 0 | 0 | 0.005 | 0 |
| 3.65999999999986 | 0.069 | 0 | 0 | 0.005 | 0 |
| 3.66499999999986 | 0.069 | 0 | 0 | 0.005 | 0 |
| 3.669999999999859 | 0.069 | 0 | 0 | 0.005 | 0 |
| 3.674999999999859 | 0.069 | 0 | 0 | 0.005 | 0 |
| 3.679999999999859 | 0.069 | 0 | 0 | 0.005 | 0 |
| 3.684999999999859 | 0.069 | 0 | 0 | 0.005 | 0 |
| 3.689999999999859 | 0.068 | 0 | 0 | 0.005 | 0 |
| 3.694999999999859 | 0.068 | 0 | 0 | 0.005 | 0 |
| 3.699999999999859 | 0.068 | 0 | 0 | 0.005 | 0 |
| 3.704999999999859 | 0.068 | 0 | 0 | 0.005 | 0 |
| 3.709999999999859 | 0.068 | 0 | 0 | 0.005 | 0 |
| 3.714999999999859 | 0.068 | 0 | 0 | 0.005 | 0 |
| 3.719999999999858 | 0.067 | 0 | 0 | 0.005 | 0 |
| 3.724999999999858 | 0.067 | 0 | 0 | 0.005 | 0 |
| 3.729999999999858 | 0.067 | 0 | 0 | 0.004 | 0 |
| 3.734999999999858 | 0.067 | 0 | 0 | 0.004 | 0 |
| 3.739999999999858 | 0.067 | 0 | 0 | 0.004 | 0 |
| 3.744999999999858 | 0.067 | 0 | 0 | 0.004 | 0 |
| 3.749999999999858 | 0.066 | 0 | 0 | 0.004 | 0 |
| 3.754999999999858 | 0.066 | 0 | 0 | 0.004 | 0 |
| 3.759999999999858 | 0.066 | 0 | 0 | 0.004 | 0 |
| 3.764999999999857 | 0.066 | 0 | 0 | 0.004 | 0 |
| 3.769999999999857 | 0.066 | 0 | 0 | 0.004 | 0 |
| 3.774999999999857 | 0.066 | 0 | 0 | 0.004 | 0 |
| 3.779999999999857 | 0.065 | 0 | 0 | 0.004 | 0 |
| 3.784999999999857 | 0.065 | 0 | 0 | 0.004 | 0 |
| 3.789999999999857 | 0.065 | 0 | 0 | 0.004 | 0 |
| 3.794999999999857 | 0.065 | 0 | 0 | 0.004 | 0 |
| 3.799999999999857 | 0.065 | 0 | 0 | 0.004 | 0 |
| 3.804999999999857 | 0.065 | 0 | 0 | 0.004 | 0 |
| 3.809999999999857 | 0.064 | 0 | 0 | 0.004 | 0 |
| 3.814999999999856 | 0.064 | 0 | 0 | 0.004 | 0 |
| 3.819999999999856 | 0.064 | 0 | 0 | 0.004 | 0 |
| 3.824999999999856 | 0.064 | 0 | 0 | 0.004 | 0 |
| 3.829999999999856 | 0.064 | 0 | 0 | 0.004 | 0 |
| 3.834999999999856 | 0.064 | 0 | 0 | 0.004 | 0 |
| 3.839999999999856 | 0.064 | 0 | 0 | 0.004 | 0 |
| 3.844999999999856 | 0.063 | 0 | 0 | 0.004 | 0 |
| 3.849999999999856 | 0.063 | 0 | 0 | 0.004 | 0 |
| 3.854999999999856 | 0.063 | 0 | 0 | 0.004 | 0 |
| 3.859999999999855 | 0.063 | 0 | 0 | 0.004 | 0 |
| 3.864999999999855 | 0.063 | 0 | 0 | 0.004 | 0 |
| 3.869999999999855 | 0.063 | 0 | 0 | 0.004 | 0 |
| 3.874999999999855 | 0.062 | 0 | 0 | 0.004 | 0 |
| 3.879999999999855 | 0.062 | 0 | 0 | 0.004 | 0 |
| 3.884999999999855 | 0.062 | 0 | 0 | 0.004 | 0 |
| 3.889999999999855 | 0.062 | 0 | 0 | 0.004 | 0 |
| 3.894999999999855 | 0.062 | 0 | 0 | 0.004 | 0 |
| 3.899999999999855 | 0.062 | 0 | 0 | 0.004 | 0 |
| 3.904999999999855 | 0.062 | 0 | 0 | 0.004 | 0 |
| 3.909999999999854 | 0.061 | 0 | 0 | 0.004 | 0 |
| 3.914999999999854 | 0.061 | 0 | 0 | 0.004 | 0 |
| 3.919999999999854 | 0.061 | 0 | 0 | 0.004 | 0 |
| 3.924999999999854 | 0.061 | 0 | 0 | 0.004 | 0 |
| 3.929999999999854 | 0.061 | 0 | 0 | 0.004 | 0 |
| 3.934999999999854 | 0.061 | 0 | 0 | 0.004 | 0 |
| 3.939999999999854 | 0.061 | 0 | 0 | 0.004 | 0 |
| 3.944999999999854 | 0.06 | 0 | 0 | 0.004 | 0 |
| 3.949999999999854 | 0.06 | 0 | 0 | 0.004 | 0 |
| 3.954999999999853 | 0.06 | 0 | 0 | 0.004 | 0 |
| 3.959999999999853 | 0.06 | 0 | 0 | 0.004 | 0 |
| 3.964999999999853 | 0.06 | 0 | 0 | 0.004 | 0 |
| 3.969999999999853 | 0.06 | 0 | 0 | 0.004 | 0 |
| 3.974999999999853 | 0.06 | 0 | 0 | 0.004 | 0 |
| 3.979999999999853 | 0.059 | 0 | 0 | 0.004 | 0 |
| 3.984999999999853 | 0.059 | 0 | 0 | 0.004 | 0 |
| 3.989999999999853 | 0.059 | 0 | 0 | 0.003 | 0 |
| 3.994999999999853 | 0.059 | 0 | 0 | 0.003 | 0 |
| 3.999999999999853 | 0.059 | 0 | 0 | 0.003 | 0 |
| 4.004999999999852 | 0.059 | 0 | 0 | 0.003 | 0 |
| 4.009999999999852 | 0.059 | 0 | 0 | 0.003 | 0 |
| 4.014999999999852 | 0.058 | 0 | 0 | 0.003 | 0 |
| 4.019999999999852 | 0.058 | 0 | 0 | 0.003 | 0 |
| 4.024999999999852 | 0.058 | 0 | 0 | 0.003 | 0 |
| 4.029999999999852 | 0.058 | 0 | 0 | 0.003 | 0 |
| 4.034999999999852 | 0.058 | 0 | 0 | 0.003 | 0 |
| 4.039999999999851 | 0.058 | 0 | 0 | 0.003 | 0 |
| 4.044999999999852 | 0.058 | 0 | 0 | 0.003 | 0 |
| 4.049999999999851 | 0.057 | 0 | 0 | 0.003 | 0 |
| 4.054999999999851 | 0.057 | 0 | 0 | 0.003 | 0 |
| 4.059999999999851 | 0.057 | 0 | 0 | 0.003 | 0 |
| 4.064999999999851 | 0.057 | 0 | 0 | 0.003 | 0 |
| 4.069999999999851 | 0.057 | 0 | 0 | 0.003 | 0 |
| 4.074999999999851 | 0.057 | 0 | 0 | 0.003 | 0 |
| 4.07999999999985 | 0.057 | 0 | 0 | 0.003 | 0 |
| 4.084999999999851 | 0.057 | 0 | 0 | 0.003 | 0 |
| 4.08999999999985 | 0.056 | 0 | 0 | 0.003 | 0 |
| 4.094999999999851 | 0.056 | 0 | 0 | 0.003 | 0 |
| 4.09999999999985 | 0.056 | 0 | 0 | 0.003 | 0 |
| 4.10499999999985 | 0.056 | 0 | 0 | 0.003 | 0 |
| 4.10999999999985 | 0.056 | 0 | 0 | 0.003 | 0 |
| 4.11499999999985 | 0.056 | 0 | 0 | 0.003 | 0 |
| 4.11999999999985 | 0.056 | 0 | 0 | 0.003 | 0 |
| 4.12499999999985 | 0.056 | 0 | 0 | 0.003 | 0 |
| 4.12999999999985 | 0.055 | 0 | 0 | 0.003 | 0 |
| 4.13499999999985 | 0.055 | 0 | 0 | 0.003 | 0 |
| 4.13999999999985 | 0.055 | 0 | 0 | 0.003 | 0 |
| 4.144999999999849 | 0.055 | 0 | 0 | 0.003 | 0 |
| 4.14999999999985 | 0.055 | 0 | 0 | 0.003 | 0 |
| 4.154999999999849 | 0.055 | 0 | 0 | 0.003 | 0 |
| 4.15999999999985 | 0.055 | 0 | 0 | 0.003 | 0 |
| 4.164999999999849 | 0.055 | 0 | 0 | 0.003 | 0 |
| 4.169999999999849 | 0.054 | 0 | 0 | 0.003 | 0 |
| 4.174999999999849 | 0.054 | 0 | 0 | 0.003 | 0 |
| 4.179999999999848 | 0.054 | 0 | 0 | 0.003 | 0 |
| 4.184999999999849 | 0.054 | 0 | 0 | 0.003 | 0 |
| 4.189999999999848 | 0.054 | 0 | 0 | 0.003 | 0 |
| 4.194999999999848 | 0.054 | 0 | 0 | 0.003 | 0 |
| 4.199999999999848 | 0.054 | 0 | 0 | 0.003 | 0 |
| 4.204999999999848 | 0.054 | 0 | 0 | 0.003 | 0 |
| 4.209999999999848 | 0.053 | 0 | 0 | 0.003 | 0 |
| 4.214999999999848 | 0.053 | 0 | 0 | 0.003 | 0 |
| 4.219999999999847 | 0.053 | 0 | 0 | 0.003 | 0 |
| 4.224999999999848 | 0.053 | 0 | 0 | 0.003 | 0 |
| 4.229999999999847 | 0.053 | 0 | 0 | 0.003 | 0 |
| 4.234999999999847 | 0.053 | 0 | 0 | 0.003 | 0 |
| 4.239999999999847 | 0.053 | 0 | 0 | 0.003 | 0 |
| 4.244999999999847 | 0.053 | 0 | 0 | 0.003 | 0 |
| 4.249999999999847 | 0.052 | 0 | 0 | 0.003 | 0 |
| 4.254999999999847 | 0.052 | 0 | 0 | 0.003 | 0 |
| 4.259999999999846 | 0.052 | 0 | 0 | 0.003 | 0 |
| 4.264999999999847 | 0.052 | 0 | 0 | 0.003 | 0 |
| 4.269999999999846 | 0.052 | 0 | 0 | 0.003 | 0 |
| 4.274999999999846 | 0.052 | 0 | 0 | 0.003 | 0 |
| 4.279999999999846 | 0.052 | 0 | 0 | 0.003 | 0 |
| 4.284999999999846 | 0.052 | 0 | 0 | 0.003 | 0 |
| 4.289999999999846 | 0.052 | 0 | 0 | 0.003 | 0 |
| 4.294999999999846 | 0.051 | 0 | 0 | 0.003 | 0 |
| 4.299999999999846 | 0.051 | 0 | 0 | 0.003 | 0 |
| 4.304999999999846 | 0.051 | 0 | 0 | 0.003 | 0 |
| 4.309999999999845 | 0.051 | 0 | 0 | 0.003 | 0 |
| 4.314999999999846 | 0.051 | 0 | 0 | 0.003 | 0 |
| 4.319999999999845 | 0.051 | 0 | 0 | 0.003 | 0 |
| 4.324999999999846 | 0.051 | 0 | 0 | 0.003 | 0 |
| 4.329999999999845 | 0.051 | 0 | 0 | 0.003 | 0 |
| 4.334999999999845 | 0.051 | 0 | 0 | 0.003 | 0 |
| 4.339999999999845 | 0.05 | 0 | 0 | 0.003 | 0 |
| 4.344999999999845 | 0.05 | 0 | 0 | 0.003 | 0 |
| 4.349999999999845 | 0.05 | 0 | 0 | 0.003 | 0 |
| 4.354999999999845 | 0.05 | 0 | 0 | 0.003 | 0 |
| 4.359999999999844 | 0.05 | 0 | 0 | 0.002 | 0 |
| 4.364999999999845 | 0.05 | 0 | 0 | 0.002 | 0 |
| 4.369999999999844 | 0.05 | 0 | 0 | 0.002 | 0 |
| 4.374999999999844 | 0.05 | 0 | 0 | 0.002 | 0 |
| 4.379999999999844 | 0.05 | 0 | 0 | 0.002 | 0 |
| 4.384999999999844 | 0.049 | 0 | 0 | 0.002 | 0 |
| 4.389999999999844 | 0.049 | 0 | 0 | 0.002 | 0 |
| 4.394999999999844 | 0.049 | 0 | 0 | 0.002 | 0 |
| 4.399999999999844 | 0.049 | 0 | 0 | 0.002 | 0 |
| 4.404999999999844 | 0.049 | 0 | 0 | 0.002 | 0 |
| 4.409999999999843 | 0.049 | 0 | 0 | 0.002 | 0 |
| 4.414999999999844 | 0.049 | 0 | 0 | 0.002 | 0 |
| 4.419999999999843 | 0.049 | 0 | 0 | 0.002 | 0 |
| 4.424999999999843 | 0.049 | 0 | 0 | 0.002 | 0 |
| 4.429999999999843 | 0.048 | 0 | 0 | 0.002 | 0 |
| 4.434999999999843 | 0.048 | 0 | 0 | 0.002 | 0 |
| 4.439999999999843 | 0.048 | 0 | 0 | 0.002 | 0 |
| 4.444999999999843 | 0.048 | 0 | 0 | 0.002 | 0 |
| 4.449999999999842 | 0.048 | 0 | 0 | 0.002 | 0 |
| 4.454999999999843 | 0.048 | 0 | 0 | 0.002 | 0 |
| 4.459999999999842 | 0.048 | 0 | 0 | 0.002 | 0 |
| 4.464999999999843 | 0.048 | 0 | 0 | 0.002 | 0 |
| 4.469999999999842 | 0.048 | 0 | 0 | 0.002 | 0 |
| 4.474999999999842 | 0.048 | 0 | 0 | 0.002 | 0 |
| 4.479999999999842 | 0.047 | 0 | 0 | 0.002 | 0 |
| 4.484999999999842 | 0.047 | 0 | 0 | 0.002 | 0 |
| 4.489999999999842 | 0.047 | 0 | 0 | 0.002 | 0 |
| 4.494999999999842 | 0.047 | 0 | 0 | 0.002 | 0 |
| 4.499999999999841 | 0.047 | 0 | 0 | 0.002 | 0 |
| 4.504999999999842 | 0.047 | 0 | 0 | 0.002 | 0 |
| 4.509999999999841 | 0.047 | 0 | 0 | 0.002 | 0 |
| 4.514999999999842 | 0.047 | 0 | 0 | 0.002 | 0 |
| 4.519999999999841 | 0.047 | 0 | 0 | 0.002 | 0 |
| 4.524999999999841 | 0.047 | 0 | 0 | 0.002 | 0 |
| 4.529999999999841 | 0.046 | 0 | 0 | 0.002 | 0 |
| 4.534999999999841 | 0.046 | 0 | 0 | 0.002 | 0 |
| 4.53999999999984 | 0.046 | 0 | 0 | 0.002 | 0 |
| 4.544999999999841 | 0.046 | 0 | 0 | 0.002 | 0 |
| 4.54999999999984 | 0.046 | 0 | 0 | 0.002 | 0 |
| 4.554999999999841 | 0.046 | 0 | 0 | 0.002 | 0 |
| 4.55999999999984 | 0.046 | 0 | 0 | 0.002 | 0 |
| 4.564999999999841 | 0.046 | 0 | 0 | 0.002 | 0 |
| 4.56999999999984 | 0.046 | 0 | 0 | 0.002 | 0 |
| 4.57499999999984 | 0.046 | 0 | 0 | 0.002 | 0 |
| 4.57999999999984 | 0.046 | 0 | 0 | 0.002 | 0 |
| 4.58499999999984 | 0.045 | 0 | 0 | 0.002 | 0 |
| 4.58999999999984 | 0.045 | 0 | 0 | 0.002 | 0 |
| 4.59499999999984 | 0.045 | 0 | 0 | 0.002 | 0 |
| 4.59999999999984 | 0.045 | 0 | 0 | 0.002 | 0 |
| 4.60499999999984 | 0.045 | 0 | 0 | 0.002 | 0 |
| 4.60999999999984 | 0.045 | 0 | 0 | 0.002 | 0 |
| 4.614999999999839 | 0.045 | 0 | 0 | 0.002 | 0 |
| 4.61999999999984 | 0.045 | 0 | 0 | 0.002 | 0 |
| 4.624999999999839 | 0.045 | 0 | 0 | 0.002 | 0 |
| 4.62999999999984 | 0.045 | 0 | 0 | 0.002 | 0 |
| 4.634999999999839 | 0.044 | 0 | 0 | 0.002 | 0 |
| 4.639999999999838 | 0.044 | 0 | 0 | 0.002 | 0 |
| 4.644999999999839 | 0.044 | 0 | 0 | 0.002 | 0 |
| 4.649999999999838 | 0.044 | 0 | 0 | 0.002 | 0 |
| 4.654999999999839 | 0.044 | 0 | 0 | 0.002 | 0 |
| 4.659999999999838 | 0.044 | 0 | 0 | 0.002 | 0 |
| 4.664999999999838 | 0.044 | 0 | 0 | 0.002 | 0 |
| 4.669999999999838 | 0.044 | 0 | 0 | 0.002 | 0 |
| 4.674999999999838 | 0.044 | 0 | 0 | 0.002 | 0 |
| 4.679999999999837 | 0.044 | 0 | 0 | 0.002 | 0 |
| 4.684999999999838 | 0.044 | 0 | 0 | 0.002 | 0 |
| 4.689999999999837 | 0.043 | 0 | 0 | 0.002 | 0 |
| 4.694999999999838 | 0.043 | 0 | 0 | 0.002 | 0 |
| 4.699999999999837 | 0.043 | 0 | 0 | 0.002 | 0 |
| 4.704999999999837 | 0.043 | 0 | 0 | 0.002 | 0 |
| 4.709999999999837 | 0.043 | 0 | 0 | 0.002 | 0 |
| 4.714999999999837 | 0.043 | 0 | 0 | 0.002 | 0 |
| 4.719999999999837 | 0.043 | 0 | 0 | 0.002 | 0 |
| 4.724999999999837 | 0.043 | 0 | 0 | 0.002 | 0 |
| 4.729999999999836 | 0.043 | 0 | 0 | 0.002 | 0 |
| 4.734999999999836 | 0.043 | 0 | 0 | 0.002 | 0 |
| 4.739999999999836 | 0.043 | 0 | 0 | 0.002 | 0 |
| 4.744999999999836 | 0.043 | 0 | 0 | 0.002 | 0 |
| 4.749999999999836 | 0.042 | 0 | 0 | 0.002 | 0 |
| 4.754999999999836 | 0.042 | 0 | 0 | 0.002 | 0 |
| 4.759999999999836 | 0.042 | 0 | 0 | 0.002 | 0 |
| 4.764999999999836 | 0.042 | 0 | 0 | 0.002 | 0 |
| 4.769999999999836 | 0.042 | 0 | 0 | 0.002 | 0 |
| 4.774999999999835 | 0.042 | 0 | 0 | 0.002 | 0 |
| 4.779999999999835 | 0.042 | 0 | 0 | 0.002 | 0 |
| 4.784999999999835 | 0.042 | 0 | 0 | 0.002 | 0 |
| 4.789999999999835 | 0.042 | 0 | 0 | 0.002 | 0 |
| 4.794999999999835 | 0.042 | 0 | 0 | 0.002 | 0 |
| 4.799999999999835 | 0.042 | 0 | 0 | 0.002 | 0 |
| 4.804999999999835 | 0.042 | 0 | 0 | 0.002 | 0 |
| 4.809999999999835 | 0.041 | 0 | 0 | 0.002 | 0 |
| 4.814999999999835 | 0.041 | 0 | 0 | 0.002 | 0 |
| 4.819999999999835 | 0.041 | 0 | 0 | 0.002 | 0 |
| 4.824999999999835 | 0.041 | 0 | 0 | 0.002 | 0 |
| 4.829999999999834 | 0.041 | 0 | 0 | 0.002 | 0 |
| 4.834999999999834 | 0.041 | 0 | 0 | 0.002 | 0 |
| 4.839999999999834 | 0.041 | 0 | 0 | 0.002 | 0 |
| 4.844999999999834 | 0.041 | 0 | 0 | 0.002 | 0 |
| 4.849999999999834 | 0.041 | 0 | 0 | 0.002 | 0 |
| 4.854999999999834 | 0.041 | 0 | 0 | 0.002 | 0 |
| 4.859999999999834 | 0.041 | 0 | 0 | 0.002 | 0 |
| 4.864999999999834 | 0.041 | 0 | 0 | 0.002 | 0 |
| 4.869999999999834 | 0.04 | 0 | 0 | 0.002 | 0 |
| 4.874999999999834 | 0.04 | 0 | 0 | 0.002 | 0 |
| 4.879999999999833 | 0.04 | 0 | 0 | 0.002 | 0 |
| 4.884999999999834 | 0.04 | 0 | 0 | 0.002 | 0 |
| 4.889999999999833 | 0.04 | 0 | 0 | 0.002 | 0 |
| 4.894999999999833 | 0.04 | 0 | 0 | 0.002 | 0 |
| 4.899999999999833 | 0.04 | 0 | 0 | 0.002 | 0 |
| 4.904999999999833 | 0.04 | 0 | 0 | 0.002 | 0 |
| 4.909999999999833 | 0.04 | 0 | 0 | 0.002 | 0 |
| 4.914999999999833 | 0.04 | 0 | 0 | 0.002 | 0 |
| 4.919999999999832 | 0.04 | 0 | 0 | 0.002 | 0 |
| 4.924999999999833 | 0.04 | 0 | 0 | 0.002 | 0 |
| 4.929999999999832 | 0.04 | 0 | 0 | 0.002 | 0 |
| 4.934999999999832 | 0.039 | 0 | 0 | 0.002 | 0 |
| 4.939999999999832 | 0.039 | 0 | 0 | 0.002 | 0 |
| 4.944999999999832 | 0.039 | 0 | 0 | 0.002 | 0 |
| 4.949999999999832 | 0.039 | 0 | 0 | 0.002 | 0 |
| 4.954999999999832 | 0.039 | 0 | 0 | 0.002 | 0 |
| 4.959999999999832 | 0.039 | 0 | 0 | 0.002 | 0 |
| 4.964999999999832 | 0.039 | 0 | 0 | 0.002 | 0 |
| 4.969999999999831 | 0.039 | 0 | 0 | 0.002 | 0 |
| 4.974999999999831 | 0.039 | 0 | 0 | 0.002 | 0 |
| 4.97999999999983 | 0.039 | 0 | 0 | 0.002 | 0 |
| 4.984999999999831 | 0.039 | 0 | 0 | 0.001 | 0 |
| 4.98999999999983 | 0.039 | 0 | 0 | 0.001 | 0 |
| 4.994999999999831 | 0.039 | 0 | 0 | 0.001 | 0 |
| 4.99999999999983 | 0.038 | 0 | 0 | 0.001 | 0 |